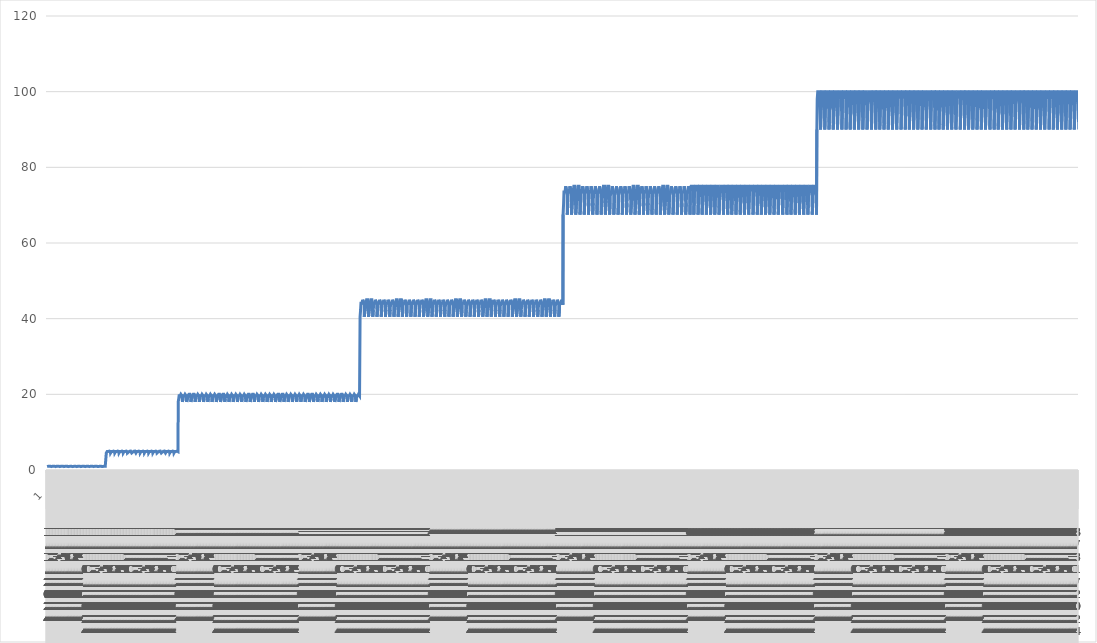
| Category | Series 0 |
|---|---|
| 0 | 0.9 |
| 1 | 0.9 |
| 2 | 0.9 |
| 3 | 0.94 |
| 4 | 0.94 |
| 5 | 0.98 |
| 6 | 0.98 |
| 7 | 0.98 |
| 8 | 0.98 |
| 9 | 0.98 |
| 10 | 0.98 |
| 11 | 0.98 |
| 12 | 0.98 |
| 13 | 0.98 |
| 14 | 0.98 |
| 15 | 1 |
| 16 | 1 |
| 17 | 1 |
| 18 | 1 |
| 19 | 1 |
| 20 | 1 |
| 21 | 0.98 |
| 22 | 0.98 |
| 23 | 0.97 |
| 24 | 0.9 |
| 25 | 0.9 |
| 26 | 0.9 |
| 27 | 0.94 |
| 28 | 0.94 |
| 29 | 0.98 |
| 30 | 0.98 |
| 31 | 0.98 |
| 32 | 0.98 |
| 33 | 0.98 |
| 34 | 0.98 |
| 35 | 0.98 |
| 36 | 0.98 |
| 37 | 0.98 |
| 38 | 0.98 |
| 39 | 1 |
| 40 | 1 |
| 41 | 1 |
| 42 | 1 |
| 43 | 1 |
| 44 | 1 |
| 45 | 0.98 |
| 46 | 0.98 |
| 47 | 0.97 |
| 48 | 0.9 |
| 49 | 0.9 |
| 50 | 0.9 |
| 51 | 0.94 |
| 52 | 0.94 |
| 53 | 0.98 |
| 54 | 0.98 |
| 55 | 0.98 |
| 56 | 0.98 |
| 57 | 0.98 |
| 58 | 0.98 |
| 59 | 0.98 |
| 60 | 0.98 |
| 61 | 0.98 |
| 62 | 0.98 |
| 63 | 1 |
| 64 | 1 |
| 65 | 1 |
| 66 | 1 |
| 67 | 1 |
| 68 | 1 |
| 69 | 0.98 |
| 70 | 0.98 |
| 71 | 0.97 |
| 72 | 0.9 |
| 73 | 0.9 |
| 74 | 0.9 |
| 75 | 0.94 |
| 76 | 0.94 |
| 77 | 0.98 |
| 78 | 0.98 |
| 79 | 0.98 |
| 80 | 0.98 |
| 81 | 0.98 |
| 82 | 0.98 |
| 83 | 0.98 |
| 84 | 0.98 |
| 85 | 0.98 |
| 86 | 0.98 |
| 87 | 1 |
| 88 | 1 |
| 89 | 1 |
| 90 | 1 |
| 91 | 1 |
| 92 | 1 |
| 93 | 0.98 |
| 94 | 0.98 |
| 95 | 0.97 |
| 96 | 0.9 |
| 97 | 0.9 |
| 98 | 0.9 |
| 99 | 0.94 |
| 100 | 0.94 |
| 101 | 0.98 |
| 102 | 0.98 |
| 103 | 0.98 |
| 104 | 0.98 |
| 105 | 0.98 |
| 106 | 0.98 |
| 107 | 0.98 |
| 108 | 0.98 |
| 109 | 0.98 |
| 110 | 0.98 |
| 111 | 1 |
| 112 | 1 |
| 113 | 1 |
| 114 | 1 |
| 115 | 1 |
| 116 | 1 |
| 117 | 0.98 |
| 118 | 0.98 |
| 119 | 0.97 |
| 120 | 0.9 |
| 121 | 0.9 |
| 122 | 0.9 |
| 123 | 0.9 |
| 124 | 0.9 |
| 125 | 0.95 |
| 126 | 0.95 |
| 127 | 0.98 |
| 128 | 0.98 |
| 129 | 0.98 |
| 130 | 0.98 |
| 131 | 0.99 |
| 132 | 0.99 |
| 133 | 1 |
| 134 | 1 |
| 135 | 1 |
| 136 | 1 |
| 137 | 1 |
| 138 | 1 |
| 139 | 1 |
| 140 | 1 |
| 141 | 1 |
| 142 | 0.98 |
| 143 | 0.98 |
| 144 | 0.9 |
| 145 | 0.9 |
| 146 | 0.9 |
| 147 | 0.9 |
| 148 | 0.9 |
| 149 | 0.95 |
| 150 | 0.95 |
| 151 | 0.98 |
| 152 | 0.98 |
| 153 | 0.98 |
| 154 | 0.98 |
| 155 | 0.99 |
| 156 | 0.99 |
| 157 | 1 |
| 158 | 1 |
| 159 | 1 |
| 160 | 1 |
| 161 | 1 |
| 162 | 1 |
| 163 | 1 |
| 164 | 1 |
| 165 | 1 |
| 166 | 0.98 |
| 167 | 0.98 |
| 168 | 0.9 |
| 169 | 0.9 |
| 170 | 0.9 |
| 171 | 0.94 |
| 172 | 0.94 |
| 173 | 0.98 |
| 174 | 0.98 |
| 175 | 0.98 |
| 176 | 0.98 |
| 177 | 0.98 |
| 178 | 0.98 |
| 179 | 0.98 |
| 180 | 0.98 |
| 181 | 0.98 |
| 182 | 0.98 |
| 183 | 1 |
| 184 | 1 |
| 185 | 1 |
| 186 | 1 |
| 187 | 1 |
| 188 | 1 |
| 189 | 0.98 |
| 190 | 0.98 |
| 191 | 0.97 |
| 192 | 0.9 |
| 193 | 0.9 |
| 194 | 0.9 |
| 195 | 0.94 |
| 196 | 0.94 |
| 197 | 0.98 |
| 198 | 0.98 |
| 199 | 0.98 |
| 200 | 0.98 |
| 201 | 0.98 |
| 202 | 0.98 |
| 203 | 0.98 |
| 204 | 0.98 |
| 205 | 0.98 |
| 206 | 0.98 |
| 207 | 1 |
| 208 | 1 |
| 209 | 1 |
| 210 | 1 |
| 211 | 1 |
| 212 | 1 |
| 213 | 0.98 |
| 214 | 0.98 |
| 215 | 0.97 |
| 216 | 0.9 |
| 217 | 0.9 |
| 218 | 0.9 |
| 219 | 0.94 |
| 220 | 0.94 |
| 221 | 0.98 |
| 222 | 0.98 |
| 223 | 0.98 |
| 224 | 0.98 |
| 225 | 0.98 |
| 226 | 0.98 |
| 227 | 0.98 |
| 228 | 0.98 |
| 229 | 0.98 |
| 230 | 0.98 |
| 231 | 1 |
| 232 | 1 |
| 233 | 1 |
| 234 | 1 |
| 235 | 1 |
| 236 | 1 |
| 237 | 0.98 |
| 238 | 0.98 |
| 239 | 0.97 |
| 240 | 0.9 |
| 241 | 0.9 |
| 242 | 0.9 |
| 243 | 0.94 |
| 244 | 0.94 |
| 245 | 0.98 |
| 246 | 0.98 |
| 247 | 0.98 |
| 248 | 0.98 |
| 249 | 0.98 |
| 250 | 0.98 |
| 251 | 0.98 |
| 252 | 0.98 |
| 253 | 0.98 |
| 254 | 0.98 |
| 255 | 1 |
| 256 | 1 |
| 257 | 1 |
| 258 | 1 |
| 259 | 1 |
| 260 | 1 |
| 261 | 0.98 |
| 262 | 0.98 |
| 263 | 0.97 |
| 264 | 0.9 |
| 265 | 0.9 |
| 266 | 0.9 |
| 267 | 0.94 |
| 268 | 0.94 |
| 269 | 0.98 |
| 270 | 0.98 |
| 271 | 0.98 |
| 272 | 0.98 |
| 273 | 0.98 |
| 274 | 0.98 |
| 275 | 0.98 |
| 276 | 0.98 |
| 277 | 0.98 |
| 278 | 0.98 |
| 279 | 1 |
| 280 | 1 |
| 281 | 1 |
| 282 | 1 |
| 283 | 1 |
| 284 | 1 |
| 285 | 0.98 |
| 286 | 0.98 |
| 287 | 0.97 |
| 288 | 0.9 |
| 289 | 0.9 |
| 290 | 0.9 |
| 291 | 0.9 |
| 292 | 0.9 |
| 293 | 0.95 |
| 294 | 0.95 |
| 295 | 0.98 |
| 296 | 0.98 |
| 297 | 0.98 |
| 298 | 0.98 |
| 299 | 0.99 |
| 300 | 0.99 |
| 301 | 1 |
| 302 | 1 |
| 303 | 1 |
| 304 | 1 |
| 305 | 1 |
| 306 | 1 |
| 307 | 1 |
| 308 | 1 |
| 309 | 1 |
| 310 | 0.98 |
| 311 | 0.98 |
| 312 | 0.9 |
| 313 | 0.9 |
| 314 | 0.9 |
| 315 | 0.9 |
| 316 | 0.9 |
| 317 | 0.95 |
| 318 | 0.95 |
| 319 | 0.98 |
| 320 | 0.98 |
| 321 | 0.98 |
| 322 | 0.98 |
| 323 | 0.99 |
| 324 | 0.99 |
| 325 | 1 |
| 326 | 1 |
| 327 | 1 |
| 328 | 1 |
| 329 | 1 |
| 330 | 1 |
| 331 | 1 |
| 332 | 1 |
| 333 | 1 |
| 334 | 0.98 |
| 335 | 0.98 |
| 336 | 4.5 |
| 337 | 4.5 |
| 338 | 4.5 |
| 339 | 4.7 |
| 340 | 4.7 |
| 341 | 4.9 |
| 342 | 4.9 |
| 343 | 4.9 |
| 344 | 4.9 |
| 345 | 4.9 |
| 346 | 4.9 |
| 347 | 4.9 |
| 348 | 4.9 |
| 349 | 4.9 |
| 350 | 4.9 |
| 351 | 5 |
| 352 | 5 |
| 353 | 5 |
| 354 | 5 |
| 355 | 5 |
| 356 | 5 |
| 357 | 4.9 |
| 358 | 4.9 |
| 359 | 4.85 |
| 360 | 4.5 |
| 361 | 4.5 |
| 362 | 4.5 |
| 363 | 4.7 |
| 364 | 4.7 |
| 365 | 4.9 |
| 366 | 4.9 |
| 367 | 4.9 |
| 368 | 4.9 |
| 369 | 4.9 |
| 370 | 4.9 |
| 371 | 4.9 |
| 372 | 4.9 |
| 373 | 4.9 |
| 374 | 4.9 |
| 375 | 5 |
| 376 | 5 |
| 377 | 5 |
| 378 | 5 |
| 379 | 5 |
| 380 | 5 |
| 381 | 4.9 |
| 382 | 4.9 |
| 383 | 4.85 |
| 384 | 4.5 |
| 385 | 4.5 |
| 386 | 4.5 |
| 387 | 4.7 |
| 388 | 4.7 |
| 389 | 4.9 |
| 390 | 4.9 |
| 391 | 4.9 |
| 392 | 4.9 |
| 393 | 4.9 |
| 394 | 4.9 |
| 395 | 4.9 |
| 396 | 4.9 |
| 397 | 4.9 |
| 398 | 4.9 |
| 399 | 5 |
| 400 | 5 |
| 401 | 5 |
| 402 | 5 |
| 403 | 5 |
| 404 | 5 |
| 405 | 4.9 |
| 406 | 4.9 |
| 407 | 4.85 |
| 408 | 4.5 |
| 409 | 4.5 |
| 410 | 4.5 |
| 411 | 4.7 |
| 412 | 4.7 |
| 413 | 4.9 |
| 414 | 4.9 |
| 415 | 4.9 |
| 416 | 4.9 |
| 417 | 4.9 |
| 418 | 4.9 |
| 419 | 4.9 |
| 420 | 4.9 |
| 421 | 4.9 |
| 422 | 4.9 |
| 423 | 5 |
| 424 | 5 |
| 425 | 5 |
| 426 | 5 |
| 427 | 5 |
| 428 | 5 |
| 429 | 4.9 |
| 430 | 4.9 |
| 431 | 4.85 |
| 432 | 4.5 |
| 433 | 4.5 |
| 434 | 4.5 |
| 435 | 4.7 |
| 436 | 4.7 |
| 437 | 4.9 |
| 438 | 4.9 |
| 439 | 4.9 |
| 440 | 4.9 |
| 441 | 4.9 |
| 442 | 4.9 |
| 443 | 4.9 |
| 444 | 4.9 |
| 445 | 4.9 |
| 446 | 4.9 |
| 447 | 5 |
| 448 | 5 |
| 449 | 5 |
| 450 | 5 |
| 451 | 5 |
| 452 | 5 |
| 453 | 4.9 |
| 454 | 4.9 |
| 455 | 4.85 |
| 456 | 4.5 |
| 457 | 4.5 |
| 458 | 4.5 |
| 459 | 4.5 |
| 460 | 4.5 |
| 461 | 4.75 |
| 462 | 4.75 |
| 463 | 4.9 |
| 464 | 4.9 |
| 465 | 4.9 |
| 466 | 4.9 |
| 467 | 4.95 |
| 468 | 4.95 |
| 469 | 5 |
| 470 | 5 |
| 471 | 5 |
| 472 | 5 |
| 473 | 5 |
| 474 | 5 |
| 475 | 5 |
| 476 | 5 |
| 477 | 5 |
| 478 | 4.9 |
| 479 | 4.9 |
| 480 | 4.5 |
| 481 | 4.5 |
| 482 | 4.5 |
| 483 | 4.5 |
| 484 | 4.5 |
| 485 | 4.75 |
| 486 | 4.75 |
| 487 | 4.9 |
| 488 | 4.9 |
| 489 | 4.9 |
| 490 | 4.9 |
| 491 | 4.95 |
| 492 | 4.95 |
| 493 | 5 |
| 494 | 5 |
| 495 | 5 |
| 496 | 5 |
| 497 | 5 |
| 498 | 5 |
| 499 | 5 |
| 500 | 5 |
| 501 | 5 |
| 502 | 4.9 |
| 503 | 4.9 |
| 504 | 4.5 |
| 505 | 4.5 |
| 506 | 4.5 |
| 507 | 4.7 |
| 508 | 4.7 |
| 509 | 4.9 |
| 510 | 4.9 |
| 511 | 4.9 |
| 512 | 4.9 |
| 513 | 4.9 |
| 514 | 4.9 |
| 515 | 4.9 |
| 516 | 4.9 |
| 517 | 4.9 |
| 518 | 4.9 |
| 519 | 5 |
| 520 | 5 |
| 521 | 5 |
| 522 | 5 |
| 523 | 5 |
| 524 | 5 |
| 525 | 4.9 |
| 526 | 4.9 |
| 527 | 4.85 |
| 528 | 4.5 |
| 529 | 4.5 |
| 530 | 4.5 |
| 531 | 4.7 |
| 532 | 4.7 |
| 533 | 4.9 |
| 534 | 4.9 |
| 535 | 4.9 |
| 536 | 4.9 |
| 537 | 4.9 |
| 538 | 4.9 |
| 539 | 4.9 |
| 540 | 4.9 |
| 541 | 4.9 |
| 542 | 4.9 |
| 543 | 5 |
| 544 | 5 |
| 545 | 5 |
| 546 | 5 |
| 547 | 5 |
| 548 | 5 |
| 549 | 4.9 |
| 550 | 4.9 |
| 551 | 4.85 |
| 552 | 4.5 |
| 553 | 4.5 |
| 554 | 4.5 |
| 555 | 4.7 |
| 556 | 4.7 |
| 557 | 4.9 |
| 558 | 4.9 |
| 559 | 4.9 |
| 560 | 4.9 |
| 561 | 4.9 |
| 562 | 4.9 |
| 563 | 4.9 |
| 564 | 4.9 |
| 565 | 4.9 |
| 566 | 4.9 |
| 567 | 5 |
| 568 | 5 |
| 569 | 5 |
| 570 | 5 |
| 571 | 5 |
| 572 | 5 |
| 573 | 4.9 |
| 574 | 4.9 |
| 575 | 4.85 |
| 576 | 4.5 |
| 577 | 4.5 |
| 578 | 4.5 |
| 579 | 4.7 |
| 580 | 4.7 |
| 581 | 4.9 |
| 582 | 4.9 |
| 583 | 4.9 |
| 584 | 4.9 |
| 585 | 4.9 |
| 586 | 4.9 |
| 587 | 4.9 |
| 588 | 4.9 |
| 589 | 4.9 |
| 590 | 4.9 |
| 591 | 5 |
| 592 | 5 |
| 593 | 5 |
| 594 | 5 |
| 595 | 5 |
| 596 | 5 |
| 597 | 4.9 |
| 598 | 4.9 |
| 599 | 4.85 |
| 600 | 4.5 |
| 601 | 4.5 |
| 602 | 4.5 |
| 603 | 4.7 |
| 604 | 4.7 |
| 605 | 4.9 |
| 606 | 4.9 |
| 607 | 4.9 |
| 608 | 4.9 |
| 609 | 4.9 |
| 610 | 4.9 |
| 611 | 4.9 |
| 612 | 4.9 |
| 613 | 4.9 |
| 614 | 4.9 |
| 615 | 5 |
| 616 | 5 |
| 617 | 5 |
| 618 | 5 |
| 619 | 5 |
| 620 | 5 |
| 621 | 4.9 |
| 622 | 4.9 |
| 623 | 4.85 |
| 624 | 4.5 |
| 625 | 4.5 |
| 626 | 4.5 |
| 627 | 4.5 |
| 628 | 4.5 |
| 629 | 4.75 |
| 630 | 4.75 |
| 631 | 4.9 |
| 632 | 4.9 |
| 633 | 4.9 |
| 634 | 4.9 |
| 635 | 4.95 |
| 636 | 4.95 |
| 637 | 5 |
| 638 | 5 |
| 639 | 5 |
| 640 | 5 |
| 641 | 5 |
| 642 | 5 |
| 643 | 5 |
| 644 | 5 |
| 645 | 5 |
| 646 | 4.9 |
| 647 | 4.9 |
| 648 | 4.5 |
| 649 | 4.5 |
| 650 | 4.5 |
| 651 | 4.5 |
| 652 | 4.5 |
| 653 | 4.75 |
| 654 | 4.75 |
| 655 | 4.9 |
| 656 | 4.9 |
| 657 | 4.9 |
| 658 | 4.9 |
| 659 | 4.95 |
| 660 | 4.95 |
| 661 | 5 |
| 662 | 5 |
| 663 | 5 |
| 664 | 5 |
| 665 | 5 |
| 666 | 5 |
| 667 | 5 |
| 668 | 5 |
| 669 | 5 |
| 670 | 4.9 |
| 671 | 4.9 |
| 672 | 4.5 |
| 673 | 4.5 |
| 674 | 4.5 |
| 675 | 4.7 |
| 676 | 4.7 |
| 677 | 4.9 |
| 678 | 4.9 |
| 679 | 4.9 |
| 680 | 4.9 |
| 681 | 4.9 |
| 682 | 4.9 |
| 683 | 4.9 |
| 684 | 4.9 |
| 685 | 4.9 |
| 686 | 4.9 |
| 687 | 5 |
| 688 | 5 |
| 689 | 5 |
| 690 | 5 |
| 691 | 5 |
| 692 | 5 |
| 693 | 4.9 |
| 694 | 4.9 |
| 695 | 4.85 |
| 696 | 4.5 |
| 697 | 4.5 |
| 698 | 4.5 |
| 699 | 4.7 |
| 700 | 4.7 |
| 701 | 4.9 |
| 702 | 4.9 |
| 703 | 4.9 |
| 704 | 4.9 |
| 705 | 4.9 |
| 706 | 4.9 |
| 707 | 4.9 |
| 708 | 4.9 |
| 709 | 4.9 |
| 710 | 4.9 |
| 711 | 5 |
| 712 | 5 |
| 713 | 5 |
| 714 | 5 |
| 715 | 5 |
| 716 | 5 |
| 717 | 4.9 |
| 718 | 4.9 |
| 719 | 4.85 |
| 720 | 4.5 |
| 721 | 4.5 |
| 722 | 4.5 |
| 723 | 4.7 |
| 724 | 4.7 |
| 725 | 4.9 |
| 726 | 4.9 |
| 727 | 4.9 |
| 728 | 4.9 |
| 729 | 4.9 |
| 730 | 4.9 |
| 731 | 4.9 |
| 732 | 4.9 |
| 733 | 4.9 |
| 734 | 4.9 |
| 735 | 5 |
| 736 | 5 |
| 737 | 5 |
| 738 | 5 |
| 739 | 5 |
| 740 | 5 |
| 741 | 4.9 |
| 742 | 4.9 |
| 743 | 4.85 |
| 744 | 18 |
| 745 | 18 |
| 746 | 18 |
| 747 | 18.8 |
| 748 | 18.8 |
| 749 | 19.6 |
| 750 | 19.6 |
| 751 | 19.6 |
| 752 | 19.6 |
| 753 | 19.6 |
| 754 | 19.6 |
| 755 | 19.6 |
| 756 | 19.6 |
| 757 | 19.6 |
| 758 | 19.6 |
| 759 | 20 |
| 760 | 20 |
| 761 | 20 |
| 762 | 20 |
| 763 | 20 |
| 764 | 20 |
| 765 | 19.6 |
| 766 | 19.6 |
| 767 | 19.4 |
| 768 | 18 |
| 769 | 18 |
| 770 | 18 |
| 771 | 18.8 |
| 772 | 18.8 |
| 773 | 19.6 |
| 774 | 19.6 |
| 775 | 19.6 |
| 776 | 19.6 |
| 777 | 19.6 |
| 778 | 19.6 |
| 779 | 19.6 |
| 780 | 19.6 |
| 781 | 19.6 |
| 782 | 19.6 |
| 783 | 20 |
| 784 | 20 |
| 785 | 20 |
| 786 | 20 |
| 787 | 20 |
| 788 | 20 |
| 789 | 19.6 |
| 790 | 19.6 |
| 791 | 19.4 |
| 792 | 18 |
| 793 | 18 |
| 794 | 18 |
| 795 | 18 |
| 796 | 18 |
| 797 | 19 |
| 798 | 19 |
| 799 | 19.6 |
| 800 | 19.6 |
| 801 | 19.6 |
| 802 | 19.6 |
| 803 | 19.8 |
| 804 | 19.8 |
| 805 | 20 |
| 806 | 20 |
| 807 | 20 |
| 808 | 20 |
| 809 | 20 |
| 810 | 20 |
| 811 | 20 |
| 812 | 20 |
| 813 | 20 |
| 814 | 19.6 |
| 815 | 19.6 |
| 816 | 18 |
| 817 | 18 |
| 818 | 18 |
| 819 | 18 |
| 820 | 18 |
| 821 | 19 |
| 822 | 19 |
| 823 | 19.6 |
| 824 | 19.6 |
| 825 | 19.6 |
| 826 | 19.6 |
| 827 | 19.8 |
| 828 | 19.8 |
| 829 | 20 |
| 830 | 20 |
| 831 | 20 |
| 832 | 20 |
| 833 | 20 |
| 834 | 20 |
| 835 | 20 |
| 836 | 20 |
| 837 | 20 |
| 838 | 19.6 |
| 839 | 19.6 |
| 840 | 18 |
| 841 | 18 |
| 842 | 18 |
| 843 | 18.8 |
| 844 | 18.8 |
| 845 | 19.6 |
| 846 | 19.6 |
| 847 | 19.6 |
| 848 | 19.6 |
| 849 | 19.6 |
| 850 | 19.6 |
| 851 | 19.6 |
| 852 | 19.6 |
| 853 | 19.6 |
| 854 | 19.6 |
| 855 | 20 |
| 856 | 20 |
| 857 | 20 |
| 858 | 20 |
| 859 | 20 |
| 860 | 20 |
| 861 | 19.6 |
| 862 | 19.6 |
| 863 | 19.4 |
| 864 | 18 |
| 865 | 18 |
| 866 | 18 |
| 867 | 18.8 |
| 868 | 18.8 |
| 869 | 19.6 |
| 870 | 19.6 |
| 871 | 19.6 |
| 872 | 19.6 |
| 873 | 19.6 |
| 874 | 19.6 |
| 875 | 19.6 |
| 876 | 19.6 |
| 877 | 19.6 |
| 878 | 19.6 |
| 879 | 20 |
| 880 | 20 |
| 881 | 20 |
| 882 | 20 |
| 883 | 20 |
| 884 | 20 |
| 885 | 19.6 |
| 886 | 19.6 |
| 887 | 19.4 |
| 888 | 18 |
| 889 | 18 |
| 890 | 18 |
| 891 | 18.8 |
| 892 | 18.8 |
| 893 | 19.6 |
| 894 | 19.6 |
| 895 | 19.6 |
| 896 | 19.6 |
| 897 | 19.6 |
| 898 | 19.6 |
| 899 | 19.6 |
| 900 | 19.6 |
| 901 | 19.6 |
| 902 | 19.6 |
| 903 | 20 |
| 904 | 20 |
| 905 | 20 |
| 906 | 20 |
| 907 | 20 |
| 908 | 20 |
| 909 | 19.6 |
| 910 | 19.6 |
| 911 | 19.4 |
| 912 | 18 |
| 913 | 18 |
| 914 | 18 |
| 915 | 18.8 |
| 916 | 18.8 |
| 917 | 19.6 |
| 918 | 19.6 |
| 919 | 19.6 |
| 920 | 19.6 |
| 921 | 19.6 |
| 922 | 19.6 |
| 923 | 19.6 |
| 924 | 19.6 |
| 925 | 19.6 |
| 926 | 19.6 |
| 927 | 20 |
| 928 | 20 |
| 929 | 20 |
| 930 | 20 |
| 931 | 20 |
| 932 | 20 |
| 933 | 19.6 |
| 934 | 19.6 |
| 935 | 19.4 |
| 936 | 18 |
| 937 | 18 |
| 938 | 18 |
| 939 | 18.8 |
| 940 | 18.8 |
| 941 | 19.6 |
| 942 | 19.6 |
| 943 | 19.6 |
| 944 | 19.6 |
| 945 | 19.6 |
| 946 | 19.6 |
| 947 | 19.6 |
| 948 | 19.6 |
| 949 | 19.6 |
| 950 | 19.6 |
| 951 | 20 |
| 952 | 20 |
| 953 | 20 |
| 954 | 20 |
| 955 | 20 |
| 956 | 20 |
| 957 | 19.6 |
| 958 | 19.6 |
| 959 | 19.4 |
| 960 | 18 |
| 961 | 18 |
| 962 | 18 |
| 963 | 18 |
| 964 | 18 |
| 965 | 19 |
| 966 | 19 |
| 967 | 19.6 |
| 968 | 19.6 |
| 969 | 19.6 |
| 970 | 19.6 |
| 971 | 19.8 |
| 972 | 19.8 |
| 973 | 20 |
| 974 | 20 |
| 975 | 20 |
| 976 | 20 |
| 977 | 20 |
| 978 | 20 |
| 979 | 20 |
| 980 | 20 |
| 981 | 20 |
| 982 | 19.6 |
| 983 | 19.6 |
| 984 | 18 |
| 985 | 18 |
| 986 | 18 |
| 987 | 18 |
| 988 | 18 |
| 989 | 19 |
| 990 | 19 |
| 991 | 19.6 |
| 992 | 19.6 |
| 993 | 19.6 |
| 994 | 19.6 |
| 995 | 19.8 |
| 996 | 19.8 |
| 997 | 20 |
| 998 | 20 |
| 999 | 20 |
| 1000 | 20 |
| 1001 | 20 |
| 1002 | 20 |
| 1003 | 20 |
| 1004 | 20 |
| 1005 | 20 |
| 1006 | 19.6 |
| 1007 | 19.6 |
| 1008 | 18 |
| 1009 | 18 |
| 1010 | 18 |
| 1011 | 18.8 |
| 1012 | 18.8 |
| 1013 | 19.6 |
| 1014 | 19.6 |
| 1015 | 19.6 |
| 1016 | 19.6 |
| 1017 | 19.6 |
| 1018 | 19.6 |
| 1019 | 19.6 |
| 1020 | 19.6 |
| 1021 | 19.6 |
| 1022 | 19.6 |
| 1023 | 20 |
| 1024 | 20 |
| 1025 | 20 |
| 1026 | 20 |
| 1027 | 20 |
| 1028 | 20 |
| 1029 | 19.6 |
| 1030 | 19.6 |
| 1031 | 19.4 |
| 1032 | 18 |
| 1033 | 18 |
| 1034 | 18 |
| 1035 | 18.8 |
| 1036 | 18.8 |
| 1037 | 19.6 |
| 1038 | 19.6 |
| 1039 | 19.6 |
| 1040 | 19.6 |
| 1041 | 19.6 |
| 1042 | 19.6 |
| 1043 | 19.6 |
| 1044 | 19.6 |
| 1045 | 19.6 |
| 1046 | 19.6 |
| 1047 | 20 |
| 1048 | 20 |
| 1049 | 20 |
| 1050 | 20 |
| 1051 | 20 |
| 1052 | 20 |
| 1053 | 19.6 |
| 1054 | 19.6 |
| 1055 | 19.4 |
| 1056 | 18 |
| 1057 | 18 |
| 1058 | 18 |
| 1059 | 18.8 |
| 1060 | 18.8 |
| 1061 | 19.6 |
| 1062 | 19.6 |
| 1063 | 19.6 |
| 1064 | 19.6 |
| 1065 | 19.6 |
| 1066 | 19.6 |
| 1067 | 19.6 |
| 1068 | 19.6 |
| 1069 | 19.6 |
| 1070 | 19.6 |
| 1071 | 20 |
| 1072 | 20 |
| 1073 | 20 |
| 1074 | 20 |
| 1075 | 20 |
| 1076 | 20 |
| 1077 | 19.6 |
| 1078 | 19.6 |
| 1079 | 19.4 |
| 1080 | 18 |
| 1081 | 18 |
| 1082 | 18 |
| 1083 | 18.8 |
| 1084 | 18.8 |
| 1085 | 19.6 |
| 1086 | 19.6 |
| 1087 | 19.6 |
| 1088 | 19.6 |
| 1089 | 19.6 |
| 1090 | 19.6 |
| 1091 | 19.6 |
| 1092 | 19.6 |
| 1093 | 19.6 |
| 1094 | 19.6 |
| 1095 | 20 |
| 1096 | 20 |
| 1097 | 20 |
| 1098 | 20 |
| 1099 | 20 |
| 1100 | 20 |
| 1101 | 19.6 |
| 1102 | 19.6 |
| 1103 | 19.4 |
| 1104 | 18 |
| 1105 | 18 |
| 1106 | 18 |
| 1107 | 18.8 |
| 1108 | 18.8 |
| 1109 | 19.6 |
| 1110 | 19.6 |
| 1111 | 19.6 |
| 1112 | 19.6 |
| 1113 | 19.6 |
| 1114 | 19.6 |
| 1115 | 19.6 |
| 1116 | 19.6 |
| 1117 | 19.6 |
| 1118 | 19.6 |
| 1119 | 20 |
| 1120 | 20 |
| 1121 | 20 |
| 1122 | 20 |
| 1123 | 20 |
| 1124 | 20 |
| 1125 | 19.6 |
| 1126 | 19.6 |
| 1127 | 19.4 |
| 1128 | 18 |
| 1129 | 18 |
| 1130 | 18 |
| 1131 | 18 |
| 1132 | 18 |
| 1133 | 19 |
| 1134 | 19 |
| 1135 | 19.6 |
| 1136 | 19.6 |
| 1137 | 19.6 |
| 1138 | 19.6 |
| 1139 | 19.8 |
| 1140 | 19.8 |
| 1141 | 20 |
| 1142 | 20 |
| 1143 | 20 |
| 1144 | 20 |
| 1145 | 20 |
| 1146 | 20 |
| 1147 | 20 |
| 1148 | 20 |
| 1149 | 20 |
| 1150 | 19.6 |
| 1151 | 19.6 |
| 1152 | 18 |
| 1153 | 18 |
| 1154 | 18 |
| 1155 | 18 |
| 1156 | 18 |
| 1157 | 19 |
| 1158 | 19 |
| 1159 | 19.6 |
| 1160 | 19.6 |
| 1161 | 19.6 |
| 1162 | 19.6 |
| 1163 | 19.8 |
| 1164 | 19.8 |
| 1165 | 20 |
| 1166 | 20 |
| 1167 | 20 |
| 1168 | 20 |
| 1169 | 20 |
| 1170 | 20 |
| 1171 | 20 |
| 1172 | 20 |
| 1173 | 20 |
| 1174 | 19.6 |
| 1175 | 19.6 |
| 1176 | 18 |
| 1177 | 18 |
| 1178 | 18 |
| 1179 | 18.8 |
| 1180 | 18.8 |
| 1181 | 19.6 |
| 1182 | 19.6 |
| 1183 | 19.6 |
| 1184 | 19.6 |
| 1185 | 19.6 |
| 1186 | 19.6 |
| 1187 | 19.6 |
| 1188 | 19.6 |
| 1189 | 19.6 |
| 1190 | 19.6 |
| 1191 | 20 |
| 1192 | 20 |
| 1193 | 20 |
| 1194 | 20 |
| 1195 | 20 |
| 1196 | 20 |
| 1197 | 19.6 |
| 1198 | 19.6 |
| 1199 | 19.4 |
| 1200 | 18 |
| 1201 | 18 |
| 1202 | 18 |
| 1203 | 18.8 |
| 1204 | 18.8 |
| 1205 | 19.6 |
| 1206 | 19.6 |
| 1207 | 19.6 |
| 1208 | 19.6 |
| 1209 | 19.6 |
| 1210 | 19.6 |
| 1211 | 19.6 |
| 1212 | 19.6 |
| 1213 | 19.6 |
| 1214 | 19.6 |
| 1215 | 20 |
| 1216 | 20 |
| 1217 | 20 |
| 1218 | 20 |
| 1219 | 20 |
| 1220 | 20 |
| 1221 | 19.6 |
| 1222 | 19.6 |
| 1223 | 19.4 |
| 1224 | 18 |
| 1225 | 18 |
| 1226 | 18 |
| 1227 | 18.8 |
| 1228 | 18.8 |
| 1229 | 19.6 |
| 1230 | 19.6 |
| 1231 | 19.6 |
| 1232 | 19.6 |
| 1233 | 19.6 |
| 1234 | 19.6 |
| 1235 | 19.6 |
| 1236 | 19.6 |
| 1237 | 19.6 |
| 1238 | 19.6 |
| 1239 | 20 |
| 1240 | 20 |
| 1241 | 20 |
| 1242 | 20 |
| 1243 | 20 |
| 1244 | 20 |
| 1245 | 19.6 |
| 1246 | 19.6 |
| 1247 | 19.4 |
| 1248 | 18 |
| 1249 | 18 |
| 1250 | 18 |
| 1251 | 18.8 |
| 1252 | 18.8 |
| 1253 | 19.6 |
| 1254 | 19.6 |
| 1255 | 19.6 |
| 1256 | 19.6 |
| 1257 | 19.6 |
| 1258 | 19.6 |
| 1259 | 19.6 |
| 1260 | 19.6 |
| 1261 | 19.6 |
| 1262 | 19.6 |
| 1263 | 20 |
| 1264 | 20 |
| 1265 | 20 |
| 1266 | 20 |
| 1267 | 20 |
| 1268 | 20 |
| 1269 | 19.6 |
| 1270 | 19.6 |
| 1271 | 19.4 |
| 1272 | 18 |
| 1273 | 18 |
| 1274 | 18 |
| 1275 | 18.8 |
| 1276 | 18.8 |
| 1277 | 19.6 |
| 1278 | 19.6 |
| 1279 | 19.6 |
| 1280 | 19.6 |
| 1281 | 19.6 |
| 1282 | 19.6 |
| 1283 | 19.6 |
| 1284 | 19.6 |
| 1285 | 19.6 |
| 1286 | 19.6 |
| 1287 | 20 |
| 1288 | 20 |
| 1289 | 20 |
| 1290 | 20 |
| 1291 | 20 |
| 1292 | 20 |
| 1293 | 19.6 |
| 1294 | 19.6 |
| 1295 | 19.4 |
| 1296 | 18 |
| 1297 | 18 |
| 1298 | 18 |
| 1299 | 18 |
| 1300 | 18 |
| 1301 | 19 |
| 1302 | 19 |
| 1303 | 19.6 |
| 1304 | 19.6 |
| 1305 | 19.6 |
| 1306 | 19.6 |
| 1307 | 19.8 |
| 1308 | 19.8 |
| 1309 | 20 |
| 1310 | 20 |
| 1311 | 20 |
| 1312 | 20 |
| 1313 | 20 |
| 1314 | 20 |
| 1315 | 20 |
| 1316 | 20 |
| 1317 | 20 |
| 1318 | 19.6 |
| 1319 | 19.6 |
| 1320 | 18 |
| 1321 | 18 |
| 1322 | 18 |
| 1323 | 18 |
| 1324 | 18 |
| 1325 | 19 |
| 1326 | 19 |
| 1327 | 19.6 |
| 1328 | 19.6 |
| 1329 | 19.6 |
| 1330 | 19.6 |
| 1331 | 19.8 |
| 1332 | 19.8 |
| 1333 | 20 |
| 1334 | 20 |
| 1335 | 20 |
| 1336 | 20 |
| 1337 | 20 |
| 1338 | 20 |
| 1339 | 20 |
| 1340 | 20 |
| 1341 | 20 |
| 1342 | 19.6 |
| 1343 | 19.6 |
| 1344 | 18 |
| 1345 | 18 |
| 1346 | 18 |
| 1347 | 18.8 |
| 1348 | 18.8 |
| 1349 | 19.6 |
| 1350 | 19.6 |
| 1351 | 19.6 |
| 1352 | 19.6 |
| 1353 | 19.6 |
| 1354 | 19.6 |
| 1355 | 19.6 |
| 1356 | 19.6 |
| 1357 | 19.6 |
| 1358 | 19.6 |
| 1359 | 20 |
| 1360 | 20 |
| 1361 | 20 |
| 1362 | 20 |
| 1363 | 20 |
| 1364 | 20 |
| 1365 | 19.6 |
| 1366 | 19.6 |
| 1367 | 19.4 |
| 1368 | 18 |
| 1369 | 18 |
| 1370 | 18 |
| 1371 | 18.8 |
| 1372 | 18.8 |
| 1373 | 19.6 |
| 1374 | 19.6 |
| 1375 | 19.6 |
| 1376 | 19.6 |
| 1377 | 19.6 |
| 1378 | 19.6 |
| 1379 | 19.6 |
| 1380 | 19.6 |
| 1381 | 19.6 |
| 1382 | 19.6 |
| 1383 | 20 |
| 1384 | 20 |
| 1385 | 20 |
| 1386 | 20 |
| 1387 | 20 |
| 1388 | 20 |
| 1389 | 19.6 |
| 1390 | 19.6 |
| 1391 | 19.4 |
| 1392 | 18 |
| 1393 | 18 |
| 1394 | 18 |
| 1395 | 18.8 |
| 1396 | 18.8 |
| 1397 | 19.6 |
| 1398 | 19.6 |
| 1399 | 19.6 |
| 1400 | 19.6 |
| 1401 | 19.6 |
| 1402 | 19.6 |
| 1403 | 19.6 |
| 1404 | 19.6 |
| 1405 | 19.6 |
| 1406 | 19.6 |
| 1407 | 20 |
| 1408 | 20 |
| 1409 | 20 |
| 1410 | 20 |
| 1411 | 20 |
| 1412 | 20 |
| 1413 | 19.6 |
| 1414 | 19.6 |
| 1415 | 19.4 |
| 1416 | 18 |
| 1417 | 18 |
| 1418 | 18 |
| 1419 | 18.8 |
| 1420 | 18.8 |
| 1421 | 19.6 |
| 1422 | 19.6 |
| 1423 | 19.6 |
| 1424 | 19.6 |
| 1425 | 19.6 |
| 1426 | 19.6 |
| 1427 | 19.6 |
| 1428 | 19.6 |
| 1429 | 19.6 |
| 1430 | 19.6 |
| 1431 | 20 |
| 1432 | 20 |
| 1433 | 20 |
| 1434 | 20 |
| 1435 | 20 |
| 1436 | 20 |
| 1437 | 19.6 |
| 1438 | 19.6 |
| 1439 | 19.4 |
| 1440 | 18 |
| 1441 | 18 |
| 1442 | 18 |
| 1443 | 18.8 |
| 1444 | 18.8 |
| 1445 | 19.6 |
| 1446 | 19.6 |
| 1447 | 19.6 |
| 1448 | 19.6 |
| 1449 | 19.6 |
| 1450 | 19.6 |
| 1451 | 19.6 |
| 1452 | 19.6 |
| 1453 | 19.6 |
| 1454 | 19.6 |
| 1455 | 20 |
| 1456 | 20 |
| 1457 | 20 |
| 1458 | 20 |
| 1459 | 20 |
| 1460 | 20 |
| 1461 | 19.6 |
| 1462 | 19.6 |
| 1463 | 19.4 |
| 1464 | 18 |
| 1465 | 18 |
| 1466 | 18 |
| 1467 | 18 |
| 1468 | 18 |
| 1469 | 19 |
| 1470 | 19 |
| 1471 | 19.6 |
| 1472 | 19.6 |
| 1473 | 19.6 |
| 1474 | 19.6 |
| 1475 | 19.8 |
| 1476 | 19.8 |
| 1477 | 20 |
| 1478 | 20 |
| 1479 | 20 |
| 1480 | 20 |
| 1481 | 20 |
| 1482 | 20 |
| 1483 | 20 |
| 1484 | 20 |
| 1485 | 20 |
| 1486 | 19.6 |
| 1487 | 19.6 |
| 1488 | 18 |
| 1489 | 18 |
| 1490 | 18 |
| 1491 | 18 |
| 1492 | 18 |
| 1493 | 19 |
| 1494 | 19 |
| 1495 | 19.6 |
| 1496 | 19.6 |
| 1497 | 19.6 |
| 1498 | 19.6 |
| 1499 | 19.8 |
| 1500 | 19.8 |
| 1501 | 20 |
| 1502 | 20 |
| 1503 | 20 |
| 1504 | 20 |
| 1505 | 20 |
| 1506 | 20 |
| 1507 | 20 |
| 1508 | 20 |
| 1509 | 20 |
| 1510 | 19.6 |
| 1511 | 19.6 |
| 1512 | 18 |
| 1513 | 18 |
| 1514 | 18 |
| 1515 | 18.8 |
| 1516 | 18.8 |
| 1517 | 19.6 |
| 1518 | 19.6 |
| 1519 | 19.6 |
| 1520 | 19.6 |
| 1521 | 19.6 |
| 1522 | 19.6 |
| 1523 | 19.6 |
| 1524 | 19.6 |
| 1525 | 19.6 |
| 1526 | 19.6 |
| 1527 | 20 |
| 1528 | 20 |
| 1529 | 20 |
| 1530 | 20 |
| 1531 | 20 |
| 1532 | 20 |
| 1533 | 19.6 |
| 1534 | 19.6 |
| 1535 | 19.4 |
| 1536 | 18 |
| 1537 | 18 |
| 1538 | 18 |
| 1539 | 18.8 |
| 1540 | 18.8 |
| 1541 | 19.6 |
| 1542 | 19.6 |
| 1543 | 19.6 |
| 1544 | 19.6 |
| 1545 | 19.6 |
| 1546 | 19.6 |
| 1547 | 19.6 |
| 1548 | 19.6 |
| 1549 | 19.6 |
| 1550 | 19.6 |
| 1551 | 20 |
| 1552 | 20 |
| 1553 | 20 |
| 1554 | 20 |
| 1555 | 20 |
| 1556 | 20 |
| 1557 | 19.6 |
| 1558 | 19.6 |
| 1559 | 19.4 |
| 1560 | 18 |
| 1561 | 18 |
| 1562 | 18 |
| 1563 | 18.8 |
| 1564 | 18.8 |
| 1565 | 19.6 |
| 1566 | 19.6 |
| 1567 | 19.6 |
| 1568 | 19.6 |
| 1569 | 19.6 |
| 1570 | 19.6 |
| 1571 | 19.6 |
| 1572 | 19.6 |
| 1573 | 19.6 |
| 1574 | 19.6 |
| 1575 | 20 |
| 1576 | 20 |
| 1577 | 20 |
| 1578 | 20 |
| 1579 | 20 |
| 1580 | 20 |
| 1581 | 19.6 |
| 1582 | 19.6 |
| 1583 | 19.4 |
| 1584 | 18 |
| 1585 | 18 |
| 1586 | 18 |
| 1587 | 18.8 |
| 1588 | 18.8 |
| 1589 | 19.6 |
| 1590 | 19.6 |
| 1591 | 19.6 |
| 1592 | 19.6 |
| 1593 | 19.6 |
| 1594 | 19.6 |
| 1595 | 19.6 |
| 1596 | 19.6 |
| 1597 | 19.6 |
| 1598 | 19.6 |
| 1599 | 20 |
| 1600 | 20 |
| 1601 | 20 |
| 1602 | 20 |
| 1603 | 20 |
| 1604 | 20 |
| 1605 | 19.6 |
| 1606 | 19.6 |
| 1607 | 19.4 |
| 1608 | 18 |
| 1609 | 18 |
| 1610 | 18 |
| 1611 | 18.8 |
| 1612 | 18.8 |
| 1613 | 19.6 |
| 1614 | 19.6 |
| 1615 | 19.6 |
| 1616 | 19.6 |
| 1617 | 19.6 |
| 1618 | 19.6 |
| 1619 | 19.6 |
| 1620 | 19.6 |
| 1621 | 19.6 |
| 1622 | 19.6 |
| 1623 | 20 |
| 1624 | 20 |
| 1625 | 20 |
| 1626 | 20 |
| 1627 | 20 |
| 1628 | 20 |
| 1629 | 19.6 |
| 1630 | 19.6 |
| 1631 | 19.4 |
| 1632 | 18 |
| 1633 | 18 |
| 1634 | 18 |
| 1635 | 18 |
| 1636 | 18 |
| 1637 | 19 |
| 1638 | 19 |
| 1639 | 19.6 |
| 1640 | 19.6 |
| 1641 | 19.6 |
| 1642 | 19.6 |
| 1643 | 19.8 |
| 1644 | 19.8 |
| 1645 | 20 |
| 1646 | 20 |
| 1647 | 20 |
| 1648 | 20 |
| 1649 | 20 |
| 1650 | 20 |
| 1651 | 20 |
| 1652 | 20 |
| 1653 | 20 |
| 1654 | 19.6 |
| 1655 | 19.6 |
| 1656 | 18 |
| 1657 | 18 |
| 1658 | 18 |
| 1659 | 18 |
| 1660 | 18 |
| 1661 | 19 |
| 1662 | 19 |
| 1663 | 19.6 |
| 1664 | 19.6 |
| 1665 | 19.6 |
| 1666 | 19.6 |
| 1667 | 19.8 |
| 1668 | 19.8 |
| 1669 | 20 |
| 1670 | 20 |
| 1671 | 20 |
| 1672 | 20 |
| 1673 | 20 |
| 1674 | 20 |
| 1675 | 20 |
| 1676 | 20 |
| 1677 | 20 |
| 1678 | 19.6 |
| 1679 | 19.6 |
| 1680 | 18 |
| 1681 | 18 |
| 1682 | 18 |
| 1683 | 18.8 |
| 1684 | 18.8 |
| 1685 | 19.6 |
| 1686 | 19.6 |
| 1687 | 19.6 |
| 1688 | 19.6 |
| 1689 | 19.6 |
| 1690 | 19.6 |
| 1691 | 19.6 |
| 1692 | 19.6 |
| 1693 | 19.6 |
| 1694 | 19.6 |
| 1695 | 20 |
| 1696 | 20 |
| 1697 | 20 |
| 1698 | 20 |
| 1699 | 20 |
| 1700 | 20 |
| 1701 | 19.6 |
| 1702 | 19.6 |
| 1703 | 19.4 |
| 1704 | 18 |
| 1705 | 18 |
| 1706 | 18 |
| 1707 | 18.8 |
| 1708 | 18.8 |
| 1709 | 19.6 |
| 1710 | 19.6 |
| 1711 | 19.6 |
| 1712 | 19.6 |
| 1713 | 19.6 |
| 1714 | 19.6 |
| 1715 | 19.6 |
| 1716 | 19.6 |
| 1717 | 19.6 |
| 1718 | 19.6 |
| 1719 | 20 |
| 1720 | 20 |
| 1721 | 20 |
| 1722 | 20 |
| 1723 | 20 |
| 1724 | 20 |
| 1725 | 19.6 |
| 1726 | 19.6 |
| 1727 | 19.4 |
| 1728 | 18 |
| 1729 | 18 |
| 1730 | 18 |
| 1731 | 18.8 |
| 1732 | 18.8 |
| 1733 | 19.6 |
| 1734 | 19.6 |
| 1735 | 19.6 |
| 1736 | 19.6 |
| 1737 | 19.6 |
| 1738 | 19.6 |
| 1739 | 19.6 |
| 1740 | 19.6 |
| 1741 | 19.6 |
| 1742 | 19.6 |
| 1743 | 20 |
| 1744 | 20 |
| 1745 | 20 |
| 1746 | 20 |
| 1747 | 20 |
| 1748 | 20 |
| 1749 | 19.6 |
| 1750 | 19.6 |
| 1751 | 19.4 |
| 1752 | 18 |
| 1753 | 18 |
| 1754 | 18 |
| 1755 | 18.8 |
| 1756 | 18.8 |
| 1757 | 19.6 |
| 1758 | 19.6 |
| 1759 | 19.6 |
| 1760 | 19.6 |
| 1761 | 19.6 |
| 1762 | 19.6 |
| 1763 | 19.6 |
| 1764 | 19.6 |
| 1765 | 19.6 |
| 1766 | 19.6 |
| 1767 | 20 |
| 1768 | 20 |
| 1769 | 20 |
| 1770 | 20 |
| 1771 | 20 |
| 1772 | 20 |
| 1773 | 19.6 |
| 1774 | 19.6 |
| 1775 | 19.4 |
| 1776 | 40.5 |
| 1777 | 40.5 |
| 1778 | 40.5 |
| 1779 | 42.3 |
| 1780 | 42.3 |
| 1781 | 44.1 |
| 1782 | 44.1 |
| 1783 | 44.1 |
| 1784 | 44.1 |
| 1785 | 44.1 |
| 1786 | 44.1 |
| 1787 | 44.1 |
| 1788 | 44.1 |
| 1789 | 44.1 |
| 1790 | 44.1 |
| 1791 | 45 |
| 1792 | 45 |
| 1793 | 45 |
| 1794 | 45 |
| 1795 | 45 |
| 1796 | 45 |
| 1797 | 44.1 |
| 1798 | 44.1 |
| 1799 | 43.65 |
| 1800 | 40.5 |
| 1801 | 40.5 |
| 1802 | 40.5 |
| 1803 | 40.5 |
| 1804 | 40.5 |
| 1805 | 42.75 |
| 1806 | 42.75 |
| 1807 | 44.1 |
| 1808 | 44.1 |
| 1809 | 44.1 |
| 1810 | 44.1 |
| 1811 | 44.55 |
| 1812 | 44.55 |
| 1813 | 45 |
| 1814 | 45 |
| 1815 | 45 |
| 1816 | 45 |
| 1817 | 45 |
| 1818 | 45 |
| 1819 | 45 |
| 1820 | 45 |
| 1821 | 45 |
| 1822 | 44.1 |
| 1823 | 44.1 |
| 1824 | 40.5 |
| 1825 | 40.5 |
| 1826 | 40.5 |
| 1827 | 40.5 |
| 1828 | 40.5 |
| 1829 | 42.75 |
| 1830 | 42.75 |
| 1831 | 44.1 |
| 1832 | 44.1 |
| 1833 | 44.1 |
| 1834 | 44.1 |
| 1835 | 44.55 |
| 1836 | 44.55 |
| 1837 | 45 |
| 1838 | 45 |
| 1839 | 45 |
| 1840 | 45 |
| 1841 | 45 |
| 1842 | 45 |
| 1843 | 45 |
| 1844 | 45 |
| 1845 | 45 |
| 1846 | 44.1 |
| 1847 | 44.1 |
| 1848 | 40.5 |
| 1849 | 40.5 |
| 1850 | 40.5 |
| 1851 | 42.3 |
| 1852 | 42.3 |
| 1853 | 44.1 |
| 1854 | 44.1 |
| 1855 | 44.1 |
| 1856 | 44.1 |
| 1857 | 44.1 |
| 1858 | 44.1 |
| 1859 | 44.1 |
| 1860 | 44.1 |
| 1861 | 44.1 |
| 1862 | 44.1 |
| 1863 | 45 |
| 1864 | 45 |
| 1865 | 45 |
| 1866 | 45 |
| 1867 | 45 |
| 1868 | 45 |
| 1869 | 44.1 |
| 1870 | 44.1 |
| 1871 | 43.65 |
| 1872 | 40.5 |
| 1873 | 40.5 |
| 1874 | 40.5 |
| 1875 | 42.3 |
| 1876 | 42.3 |
| 1877 | 44.1 |
| 1878 | 44.1 |
| 1879 | 44.1 |
| 1880 | 44.1 |
| 1881 | 44.1 |
| 1882 | 44.1 |
| 1883 | 44.1 |
| 1884 | 44.1 |
| 1885 | 44.1 |
| 1886 | 44.1 |
| 1887 | 45 |
| 1888 | 45 |
| 1889 | 45 |
| 1890 | 45 |
| 1891 | 45 |
| 1892 | 45 |
| 1893 | 44.1 |
| 1894 | 44.1 |
| 1895 | 43.65 |
| 1896 | 40.5 |
| 1897 | 40.5 |
| 1898 | 40.5 |
| 1899 | 42.3 |
| 1900 | 42.3 |
| 1901 | 44.1 |
| 1902 | 44.1 |
| 1903 | 44.1 |
| 1904 | 44.1 |
| 1905 | 44.1 |
| 1906 | 44.1 |
| 1907 | 44.1 |
| 1908 | 44.1 |
| 1909 | 44.1 |
| 1910 | 44.1 |
| 1911 | 45 |
| 1912 | 45 |
| 1913 | 45 |
| 1914 | 45 |
| 1915 | 45 |
| 1916 | 45 |
| 1917 | 44.1 |
| 1918 | 44.1 |
| 1919 | 43.65 |
| 1920 | 40.5 |
| 1921 | 40.5 |
| 1922 | 40.5 |
| 1923 | 42.3 |
| 1924 | 42.3 |
| 1925 | 44.1 |
| 1926 | 44.1 |
| 1927 | 44.1 |
| 1928 | 44.1 |
| 1929 | 44.1 |
| 1930 | 44.1 |
| 1931 | 44.1 |
| 1932 | 44.1 |
| 1933 | 44.1 |
| 1934 | 44.1 |
| 1935 | 45 |
| 1936 | 45 |
| 1937 | 45 |
| 1938 | 45 |
| 1939 | 45 |
| 1940 | 45 |
| 1941 | 44.1 |
| 1942 | 44.1 |
| 1943 | 43.65 |
| 1944 | 40.5 |
| 1945 | 40.5 |
| 1946 | 40.5 |
| 1947 | 42.3 |
| 1948 | 42.3 |
| 1949 | 44.1 |
| 1950 | 44.1 |
| 1951 | 44.1 |
| 1952 | 44.1 |
| 1953 | 44.1 |
| 1954 | 44.1 |
| 1955 | 44.1 |
| 1956 | 44.1 |
| 1957 | 44.1 |
| 1958 | 44.1 |
| 1959 | 45 |
| 1960 | 45 |
| 1961 | 45 |
| 1962 | 45 |
| 1963 | 45 |
| 1964 | 45 |
| 1965 | 44.1 |
| 1966 | 44.1 |
| 1967 | 43.65 |
| 1968 | 40.5 |
| 1969 | 40.5 |
| 1970 | 40.5 |
| 1971 | 40.5 |
| 1972 | 40.5 |
| 1973 | 42.75 |
| 1974 | 42.75 |
| 1975 | 44.1 |
| 1976 | 44.1 |
| 1977 | 44.1 |
| 1978 | 44.1 |
| 1979 | 44.55 |
| 1980 | 44.55 |
| 1981 | 45 |
| 1982 | 45 |
| 1983 | 45 |
| 1984 | 45 |
| 1985 | 45 |
| 1986 | 45 |
| 1987 | 45 |
| 1988 | 45 |
| 1989 | 45 |
| 1990 | 44.1 |
| 1991 | 44.1 |
| 1992 | 40.5 |
| 1993 | 40.5 |
| 1994 | 40.5 |
| 1995 | 40.5 |
| 1996 | 40.5 |
| 1997 | 42.75 |
| 1998 | 42.75 |
| 1999 | 44.1 |
| 2000 | 44.1 |
| 2001 | 44.1 |
| 2002 | 44.1 |
| 2003 | 44.55 |
| 2004 | 44.55 |
| 2005 | 45 |
| 2006 | 45 |
| 2007 | 45 |
| 2008 | 45 |
| 2009 | 45 |
| 2010 | 45 |
| 2011 | 45 |
| 2012 | 45 |
| 2013 | 45 |
| 2014 | 44.1 |
| 2015 | 44.1 |
| 2016 | 40.5 |
| 2017 | 40.5 |
| 2018 | 40.5 |
| 2019 | 42.3 |
| 2020 | 42.3 |
| 2021 | 44.1 |
| 2022 | 44.1 |
| 2023 | 44.1 |
| 2024 | 44.1 |
| 2025 | 44.1 |
| 2026 | 44.1 |
| 2027 | 44.1 |
| 2028 | 44.1 |
| 2029 | 44.1 |
| 2030 | 44.1 |
| 2031 | 45 |
| 2032 | 45 |
| 2033 | 45 |
| 2034 | 45 |
| 2035 | 45 |
| 2036 | 45 |
| 2037 | 44.1 |
| 2038 | 44.1 |
| 2039 | 43.65 |
| 2040 | 40.5 |
| 2041 | 40.5 |
| 2042 | 40.5 |
| 2043 | 42.3 |
| 2044 | 42.3 |
| 2045 | 44.1 |
| 2046 | 44.1 |
| 2047 | 44.1 |
| 2048 | 44.1 |
| 2049 | 44.1 |
| 2050 | 44.1 |
| 2051 | 44.1 |
| 2052 | 44.1 |
| 2053 | 44.1 |
| 2054 | 44.1 |
| 2055 | 45 |
| 2056 | 45 |
| 2057 | 45 |
| 2058 | 45 |
| 2059 | 45 |
| 2060 | 45 |
| 2061 | 44.1 |
| 2062 | 44.1 |
| 2063 | 43.65 |
| 2064 | 40.5 |
| 2065 | 40.5 |
| 2066 | 40.5 |
| 2067 | 42.3 |
| 2068 | 42.3 |
| 2069 | 44.1 |
| 2070 | 44.1 |
| 2071 | 44.1 |
| 2072 | 44.1 |
| 2073 | 44.1 |
| 2074 | 44.1 |
| 2075 | 44.1 |
| 2076 | 44.1 |
| 2077 | 44.1 |
| 2078 | 44.1 |
| 2079 | 45 |
| 2080 | 45 |
| 2081 | 45 |
| 2082 | 45 |
| 2083 | 45 |
| 2084 | 45 |
| 2085 | 44.1 |
| 2086 | 44.1 |
| 2087 | 43.65 |
| 2088 | 40.5 |
| 2089 | 40.5 |
| 2090 | 40.5 |
| 2091 | 42.3 |
| 2092 | 42.3 |
| 2093 | 44.1 |
| 2094 | 44.1 |
| 2095 | 44.1 |
| 2096 | 44.1 |
| 2097 | 44.1 |
| 2098 | 44.1 |
| 2099 | 44.1 |
| 2100 | 44.1 |
| 2101 | 44.1 |
| 2102 | 44.1 |
| 2103 | 45 |
| 2104 | 45 |
| 2105 | 45 |
| 2106 | 45 |
| 2107 | 45 |
| 2108 | 45 |
| 2109 | 44.1 |
| 2110 | 44.1 |
| 2111 | 43.65 |
| 2112 | 40.5 |
| 2113 | 40.5 |
| 2114 | 40.5 |
| 2115 | 42.3 |
| 2116 | 42.3 |
| 2117 | 44.1 |
| 2118 | 44.1 |
| 2119 | 44.1 |
| 2120 | 44.1 |
| 2121 | 44.1 |
| 2122 | 44.1 |
| 2123 | 44.1 |
| 2124 | 44.1 |
| 2125 | 44.1 |
| 2126 | 44.1 |
| 2127 | 45 |
| 2128 | 45 |
| 2129 | 45 |
| 2130 | 45 |
| 2131 | 45 |
| 2132 | 45 |
| 2133 | 44.1 |
| 2134 | 44.1 |
| 2135 | 43.65 |
| 2136 | 40.5 |
| 2137 | 40.5 |
| 2138 | 40.5 |
| 2139 | 40.5 |
| 2140 | 40.5 |
| 2141 | 42.75 |
| 2142 | 42.75 |
| 2143 | 44.1 |
| 2144 | 44.1 |
| 2145 | 44.1 |
| 2146 | 44.1 |
| 2147 | 44.55 |
| 2148 | 44.55 |
| 2149 | 45 |
| 2150 | 45 |
| 2151 | 45 |
| 2152 | 45 |
| 2153 | 45 |
| 2154 | 45 |
| 2155 | 45 |
| 2156 | 45 |
| 2157 | 45 |
| 2158 | 44.1 |
| 2159 | 44.1 |
| 2160 | 40.5 |
| 2161 | 40.5 |
| 2162 | 40.5 |
| 2163 | 40.5 |
| 2164 | 40.5 |
| 2165 | 42.75 |
| 2166 | 42.75 |
| 2167 | 44.1 |
| 2168 | 44.1 |
| 2169 | 44.1 |
| 2170 | 44.1 |
| 2171 | 44.55 |
| 2172 | 44.55 |
| 2173 | 45 |
| 2174 | 45 |
| 2175 | 45 |
| 2176 | 45 |
| 2177 | 45 |
| 2178 | 45 |
| 2179 | 45 |
| 2180 | 45 |
| 2181 | 45 |
| 2182 | 44.1 |
| 2183 | 44.1 |
| 2184 | 40.5 |
| 2185 | 40.5 |
| 2186 | 40.5 |
| 2187 | 42.3 |
| 2188 | 42.3 |
| 2189 | 44.1 |
| 2190 | 44.1 |
| 2191 | 44.1 |
| 2192 | 44.1 |
| 2193 | 44.1 |
| 2194 | 44.1 |
| 2195 | 44.1 |
| 2196 | 44.1 |
| 2197 | 44.1 |
| 2198 | 44.1 |
| 2199 | 45 |
| 2200 | 45 |
| 2201 | 45 |
| 2202 | 45 |
| 2203 | 45 |
| 2204 | 45 |
| 2205 | 44.1 |
| 2206 | 44.1 |
| 2207 | 43.65 |
| 2208 | 40.5 |
| 2209 | 40.5 |
| 2210 | 40.5 |
| 2211 | 42.3 |
| 2212 | 42.3 |
| 2213 | 44.1 |
| 2214 | 44.1 |
| 2215 | 44.1 |
| 2216 | 44.1 |
| 2217 | 44.1 |
| 2218 | 44.1 |
| 2219 | 44.1 |
| 2220 | 44.1 |
| 2221 | 44.1 |
| 2222 | 44.1 |
| 2223 | 45 |
| 2224 | 45 |
| 2225 | 45 |
| 2226 | 45 |
| 2227 | 45 |
| 2228 | 45 |
| 2229 | 44.1 |
| 2230 | 44.1 |
| 2231 | 43.65 |
| 2232 | 40.5 |
| 2233 | 40.5 |
| 2234 | 40.5 |
| 2235 | 42.3 |
| 2236 | 42.3 |
| 2237 | 44.1 |
| 2238 | 44.1 |
| 2239 | 44.1 |
| 2240 | 44.1 |
| 2241 | 44.1 |
| 2242 | 44.1 |
| 2243 | 44.1 |
| 2244 | 44.1 |
| 2245 | 44.1 |
| 2246 | 44.1 |
| 2247 | 45 |
| 2248 | 45 |
| 2249 | 45 |
| 2250 | 45 |
| 2251 | 45 |
| 2252 | 45 |
| 2253 | 44.1 |
| 2254 | 44.1 |
| 2255 | 43.65 |
| 2256 | 40.5 |
| 2257 | 40.5 |
| 2258 | 40.5 |
| 2259 | 42.3 |
| 2260 | 42.3 |
| 2261 | 44.1 |
| 2262 | 44.1 |
| 2263 | 44.1 |
| 2264 | 44.1 |
| 2265 | 44.1 |
| 2266 | 44.1 |
| 2267 | 44.1 |
| 2268 | 44.1 |
| 2269 | 44.1 |
| 2270 | 44.1 |
| 2271 | 45 |
| 2272 | 45 |
| 2273 | 45 |
| 2274 | 45 |
| 2275 | 45 |
| 2276 | 45 |
| 2277 | 44.1 |
| 2278 | 44.1 |
| 2279 | 43.65 |
| 2280 | 40.5 |
| 2281 | 40.5 |
| 2282 | 40.5 |
| 2283 | 42.3 |
| 2284 | 42.3 |
| 2285 | 44.1 |
| 2286 | 44.1 |
| 2287 | 44.1 |
| 2288 | 44.1 |
| 2289 | 44.1 |
| 2290 | 44.1 |
| 2291 | 44.1 |
| 2292 | 44.1 |
| 2293 | 44.1 |
| 2294 | 44.1 |
| 2295 | 45 |
| 2296 | 45 |
| 2297 | 45 |
| 2298 | 45 |
| 2299 | 45 |
| 2300 | 45 |
| 2301 | 44.1 |
| 2302 | 44.1 |
| 2303 | 43.65 |
| 2304 | 40.5 |
| 2305 | 40.5 |
| 2306 | 40.5 |
| 2307 | 40.5 |
| 2308 | 40.5 |
| 2309 | 42.75 |
| 2310 | 42.75 |
| 2311 | 44.1 |
| 2312 | 44.1 |
| 2313 | 44.1 |
| 2314 | 44.1 |
| 2315 | 44.55 |
| 2316 | 44.55 |
| 2317 | 45 |
| 2318 | 45 |
| 2319 | 45 |
| 2320 | 45 |
| 2321 | 45 |
| 2322 | 45 |
| 2323 | 45 |
| 2324 | 45 |
| 2325 | 45 |
| 2326 | 44.1 |
| 2327 | 44.1 |
| 2328 | 40.5 |
| 2329 | 40.5 |
| 2330 | 40.5 |
| 2331 | 40.5 |
| 2332 | 40.5 |
| 2333 | 42.75 |
| 2334 | 42.75 |
| 2335 | 44.1 |
| 2336 | 44.1 |
| 2337 | 44.1 |
| 2338 | 44.1 |
| 2339 | 44.55 |
| 2340 | 44.55 |
| 2341 | 45 |
| 2342 | 45 |
| 2343 | 45 |
| 2344 | 45 |
| 2345 | 45 |
| 2346 | 45 |
| 2347 | 45 |
| 2348 | 45 |
| 2349 | 45 |
| 2350 | 44.1 |
| 2351 | 44.1 |
| 2352 | 40.5 |
| 2353 | 40.5 |
| 2354 | 40.5 |
| 2355 | 42.3 |
| 2356 | 42.3 |
| 2357 | 44.1 |
| 2358 | 44.1 |
| 2359 | 44.1 |
| 2360 | 44.1 |
| 2361 | 44.1 |
| 2362 | 44.1 |
| 2363 | 44.1 |
| 2364 | 44.1 |
| 2365 | 44.1 |
| 2366 | 44.1 |
| 2367 | 45 |
| 2368 | 45 |
| 2369 | 45 |
| 2370 | 45 |
| 2371 | 45 |
| 2372 | 45 |
| 2373 | 44.1 |
| 2374 | 44.1 |
| 2375 | 43.65 |
| 2376 | 40.5 |
| 2377 | 40.5 |
| 2378 | 40.5 |
| 2379 | 42.3 |
| 2380 | 42.3 |
| 2381 | 44.1 |
| 2382 | 44.1 |
| 2383 | 44.1 |
| 2384 | 44.1 |
| 2385 | 44.1 |
| 2386 | 44.1 |
| 2387 | 44.1 |
| 2388 | 44.1 |
| 2389 | 44.1 |
| 2390 | 44.1 |
| 2391 | 45 |
| 2392 | 45 |
| 2393 | 45 |
| 2394 | 45 |
| 2395 | 45 |
| 2396 | 45 |
| 2397 | 44.1 |
| 2398 | 44.1 |
| 2399 | 43.65 |
| 2400 | 40.5 |
| 2401 | 40.5 |
| 2402 | 40.5 |
| 2403 | 42.3 |
| 2404 | 42.3 |
| 2405 | 44.1 |
| 2406 | 44.1 |
| 2407 | 44.1 |
| 2408 | 44.1 |
| 2409 | 44.1 |
| 2410 | 44.1 |
| 2411 | 44.1 |
| 2412 | 44.1 |
| 2413 | 44.1 |
| 2414 | 44.1 |
| 2415 | 45 |
| 2416 | 45 |
| 2417 | 45 |
| 2418 | 45 |
| 2419 | 45 |
| 2420 | 45 |
| 2421 | 44.1 |
| 2422 | 44.1 |
| 2423 | 43.65 |
| 2424 | 40.5 |
| 2425 | 40.5 |
| 2426 | 40.5 |
| 2427 | 42.3 |
| 2428 | 42.3 |
| 2429 | 44.1 |
| 2430 | 44.1 |
| 2431 | 44.1 |
| 2432 | 44.1 |
| 2433 | 44.1 |
| 2434 | 44.1 |
| 2435 | 44.1 |
| 2436 | 44.1 |
| 2437 | 44.1 |
| 2438 | 44.1 |
| 2439 | 45 |
| 2440 | 45 |
| 2441 | 45 |
| 2442 | 45 |
| 2443 | 45 |
| 2444 | 45 |
| 2445 | 44.1 |
| 2446 | 44.1 |
| 2447 | 43.65 |
| 2448 | 40.5 |
| 2449 | 40.5 |
| 2450 | 40.5 |
| 2451 | 42.3 |
| 2452 | 42.3 |
| 2453 | 44.1 |
| 2454 | 44.1 |
| 2455 | 44.1 |
| 2456 | 44.1 |
| 2457 | 44.1 |
| 2458 | 44.1 |
| 2459 | 44.1 |
| 2460 | 44.1 |
| 2461 | 44.1 |
| 2462 | 44.1 |
| 2463 | 45 |
| 2464 | 45 |
| 2465 | 45 |
| 2466 | 45 |
| 2467 | 45 |
| 2468 | 45 |
| 2469 | 44.1 |
| 2470 | 44.1 |
| 2471 | 43.65 |
| 2472 | 40.5 |
| 2473 | 40.5 |
| 2474 | 40.5 |
| 2475 | 40.5 |
| 2476 | 40.5 |
| 2477 | 42.75 |
| 2478 | 42.75 |
| 2479 | 44.1 |
| 2480 | 44.1 |
| 2481 | 44.1 |
| 2482 | 44.1 |
| 2483 | 44.55 |
| 2484 | 44.55 |
| 2485 | 45 |
| 2486 | 45 |
| 2487 | 45 |
| 2488 | 45 |
| 2489 | 45 |
| 2490 | 45 |
| 2491 | 45 |
| 2492 | 45 |
| 2493 | 45 |
| 2494 | 44.1 |
| 2495 | 44.1 |
| 2496 | 40.5 |
| 2497 | 40.5 |
| 2498 | 40.5 |
| 2499 | 40.5 |
| 2500 | 40.5 |
| 2501 | 42.75 |
| 2502 | 42.75 |
| 2503 | 44.1 |
| 2504 | 44.1 |
| 2505 | 44.1 |
| 2506 | 44.1 |
| 2507 | 44.55 |
| 2508 | 44.55 |
| 2509 | 45 |
| 2510 | 45 |
| 2511 | 45 |
| 2512 | 45 |
| 2513 | 45 |
| 2514 | 45 |
| 2515 | 45 |
| 2516 | 45 |
| 2517 | 45 |
| 2518 | 44.1 |
| 2519 | 44.1 |
| 2520 | 40.5 |
| 2521 | 40.5 |
| 2522 | 40.5 |
| 2523 | 42.3 |
| 2524 | 42.3 |
| 2525 | 44.1 |
| 2526 | 44.1 |
| 2527 | 44.1 |
| 2528 | 44.1 |
| 2529 | 44.1 |
| 2530 | 44.1 |
| 2531 | 44.1 |
| 2532 | 44.1 |
| 2533 | 44.1 |
| 2534 | 44.1 |
| 2535 | 45 |
| 2536 | 45 |
| 2537 | 45 |
| 2538 | 45 |
| 2539 | 45 |
| 2540 | 45 |
| 2541 | 44.1 |
| 2542 | 44.1 |
| 2543 | 43.65 |
| 2544 | 40.5 |
| 2545 | 40.5 |
| 2546 | 40.5 |
| 2547 | 42.3 |
| 2548 | 42.3 |
| 2549 | 44.1 |
| 2550 | 44.1 |
| 2551 | 44.1 |
| 2552 | 44.1 |
| 2553 | 44.1 |
| 2554 | 44.1 |
| 2555 | 44.1 |
| 2556 | 44.1 |
| 2557 | 44.1 |
| 2558 | 44.1 |
| 2559 | 45 |
| 2560 | 45 |
| 2561 | 45 |
| 2562 | 45 |
| 2563 | 45 |
| 2564 | 45 |
| 2565 | 44.1 |
| 2566 | 44.1 |
| 2567 | 43.65 |
| 2568 | 40.5 |
| 2569 | 40.5 |
| 2570 | 40.5 |
| 2571 | 42.3 |
| 2572 | 42.3 |
| 2573 | 44.1 |
| 2574 | 44.1 |
| 2575 | 44.1 |
| 2576 | 44.1 |
| 2577 | 44.1 |
| 2578 | 44.1 |
| 2579 | 44.1 |
| 2580 | 44.1 |
| 2581 | 44.1 |
| 2582 | 44.1 |
| 2583 | 45 |
| 2584 | 45 |
| 2585 | 45 |
| 2586 | 45 |
| 2587 | 45 |
| 2588 | 45 |
| 2589 | 44.1 |
| 2590 | 44.1 |
| 2591 | 43.65 |
| 2592 | 40.5 |
| 2593 | 40.5 |
| 2594 | 40.5 |
| 2595 | 42.3 |
| 2596 | 42.3 |
| 2597 | 44.1 |
| 2598 | 44.1 |
| 2599 | 44.1 |
| 2600 | 44.1 |
| 2601 | 44.1 |
| 2602 | 44.1 |
| 2603 | 44.1 |
| 2604 | 44.1 |
| 2605 | 44.1 |
| 2606 | 44.1 |
| 2607 | 45 |
| 2608 | 45 |
| 2609 | 45 |
| 2610 | 45 |
| 2611 | 45 |
| 2612 | 45 |
| 2613 | 44.1 |
| 2614 | 44.1 |
| 2615 | 43.65 |
| 2616 | 40.5 |
| 2617 | 40.5 |
| 2618 | 40.5 |
| 2619 | 42.3 |
| 2620 | 42.3 |
| 2621 | 44.1 |
| 2622 | 44.1 |
| 2623 | 44.1 |
| 2624 | 44.1 |
| 2625 | 44.1 |
| 2626 | 44.1 |
| 2627 | 44.1 |
| 2628 | 44.1 |
| 2629 | 44.1 |
| 2630 | 44.1 |
| 2631 | 45 |
| 2632 | 45 |
| 2633 | 45 |
| 2634 | 45 |
| 2635 | 45 |
| 2636 | 45 |
| 2637 | 44.1 |
| 2638 | 44.1 |
| 2639 | 43.65 |
| 2640 | 40.5 |
| 2641 | 40.5 |
| 2642 | 40.5 |
| 2643 | 40.5 |
| 2644 | 40.5 |
| 2645 | 42.75 |
| 2646 | 42.75 |
| 2647 | 44.1 |
| 2648 | 44.1 |
| 2649 | 44.1 |
| 2650 | 44.1 |
| 2651 | 44.55 |
| 2652 | 44.55 |
| 2653 | 45 |
| 2654 | 45 |
| 2655 | 45 |
| 2656 | 45 |
| 2657 | 45 |
| 2658 | 45 |
| 2659 | 45 |
| 2660 | 45 |
| 2661 | 45 |
| 2662 | 44.1 |
| 2663 | 44.1 |
| 2664 | 40.5 |
| 2665 | 40.5 |
| 2666 | 40.5 |
| 2667 | 40.5 |
| 2668 | 40.5 |
| 2669 | 42.75 |
| 2670 | 42.75 |
| 2671 | 44.1 |
| 2672 | 44.1 |
| 2673 | 44.1 |
| 2674 | 44.1 |
| 2675 | 44.55 |
| 2676 | 44.55 |
| 2677 | 45 |
| 2678 | 45 |
| 2679 | 45 |
| 2680 | 45 |
| 2681 | 45 |
| 2682 | 45 |
| 2683 | 45 |
| 2684 | 45 |
| 2685 | 45 |
| 2686 | 44.1 |
| 2687 | 44.1 |
| 2688 | 40.5 |
| 2689 | 40.5 |
| 2690 | 40.5 |
| 2691 | 42.3 |
| 2692 | 42.3 |
| 2693 | 44.1 |
| 2694 | 44.1 |
| 2695 | 44.1 |
| 2696 | 44.1 |
| 2697 | 44.1 |
| 2698 | 44.1 |
| 2699 | 44.1 |
| 2700 | 44.1 |
| 2701 | 44.1 |
| 2702 | 44.1 |
| 2703 | 45 |
| 2704 | 45 |
| 2705 | 45 |
| 2706 | 45 |
| 2707 | 45 |
| 2708 | 45 |
| 2709 | 44.1 |
| 2710 | 44.1 |
| 2711 | 43.65 |
| 2712 | 40.5 |
| 2713 | 40.5 |
| 2714 | 40.5 |
| 2715 | 42.3 |
| 2716 | 42.3 |
| 2717 | 44.1 |
| 2718 | 44.1 |
| 2719 | 44.1 |
| 2720 | 44.1 |
| 2721 | 44.1 |
| 2722 | 44.1 |
| 2723 | 44.1 |
| 2724 | 44.1 |
| 2725 | 44.1 |
| 2726 | 44.1 |
| 2727 | 45 |
| 2728 | 45 |
| 2729 | 45 |
| 2730 | 45 |
| 2731 | 45 |
| 2732 | 45 |
| 2733 | 44.1 |
| 2734 | 44.1 |
| 2735 | 43.65 |
| 2736 | 40.5 |
| 2737 | 40.5 |
| 2738 | 40.5 |
| 2739 | 42.3 |
| 2740 | 42.3 |
| 2741 | 44.1 |
| 2742 | 44.1 |
| 2743 | 44.1 |
| 2744 | 44.1 |
| 2745 | 44.1 |
| 2746 | 44.1 |
| 2747 | 44.1 |
| 2748 | 44.1 |
| 2749 | 44.1 |
| 2750 | 44.1 |
| 2751 | 45 |
| 2752 | 45 |
| 2753 | 45 |
| 2754 | 45 |
| 2755 | 45 |
| 2756 | 45 |
| 2757 | 44.1 |
| 2758 | 44.1 |
| 2759 | 43.65 |
| 2760 | 40.5 |
| 2761 | 40.5 |
| 2762 | 40.5 |
| 2763 | 42.3 |
| 2764 | 42.3 |
| 2765 | 44.1 |
| 2766 | 44.1 |
| 2767 | 44.1 |
| 2768 | 44.1 |
| 2769 | 44.1 |
| 2770 | 44.1 |
| 2771 | 44.1 |
| 2772 | 44.1 |
| 2773 | 44.1 |
| 2774 | 44.1 |
| 2775 | 45 |
| 2776 | 45 |
| 2777 | 45 |
| 2778 | 45 |
| 2779 | 45 |
| 2780 | 45 |
| 2781 | 44.1 |
| 2782 | 44.1 |
| 2783 | 43.65 |
| 2784 | 40.5 |
| 2785 | 40.5 |
| 2786 | 40.5 |
| 2787 | 42.3 |
| 2788 | 42.3 |
| 2789 | 44.1 |
| 2790 | 44.1 |
| 2791 | 44.1 |
| 2792 | 44.1 |
| 2793 | 44.1 |
| 2794 | 44.1 |
| 2795 | 44.1 |
| 2796 | 44.1 |
| 2797 | 44.1 |
| 2798 | 44.1 |
| 2799 | 45 |
| 2800 | 45 |
| 2801 | 45 |
| 2802 | 45 |
| 2803 | 45 |
| 2804 | 45 |
| 2805 | 44.1 |
| 2806 | 44.1 |
| 2807 | 43.65 |
| 2808 | 40.5 |
| 2809 | 40.5 |
| 2810 | 40.5 |
| 2811 | 40.5 |
| 2812 | 40.5 |
| 2813 | 42.75 |
| 2814 | 42.75 |
| 2815 | 44.1 |
| 2816 | 44.1 |
| 2817 | 44.1 |
| 2818 | 44.1 |
| 2819 | 44.55 |
| 2820 | 44.55 |
| 2821 | 45 |
| 2822 | 45 |
| 2823 | 45 |
| 2824 | 45 |
| 2825 | 45 |
| 2826 | 45 |
| 2827 | 45 |
| 2828 | 45 |
| 2829 | 45 |
| 2830 | 44.1 |
| 2831 | 44.1 |
| 2832 | 40.5 |
| 2833 | 40.5 |
| 2834 | 40.5 |
| 2835 | 40.5 |
| 2836 | 40.5 |
| 2837 | 42.75 |
| 2838 | 42.75 |
| 2839 | 44.1 |
| 2840 | 44.1 |
| 2841 | 44.1 |
| 2842 | 44.1 |
| 2843 | 44.55 |
| 2844 | 44.55 |
| 2845 | 45 |
| 2846 | 45 |
| 2847 | 45 |
| 2848 | 45 |
| 2849 | 45 |
| 2850 | 45 |
| 2851 | 45 |
| 2852 | 45 |
| 2853 | 45 |
| 2854 | 44.1 |
| 2855 | 44.1 |
| 2856 | 40.5 |
| 2857 | 40.5 |
| 2858 | 40.5 |
| 2859 | 42.3 |
| 2860 | 42.3 |
| 2861 | 44.1 |
| 2862 | 44.1 |
| 2863 | 44.1 |
| 2864 | 44.1 |
| 2865 | 44.1 |
| 2866 | 44.1 |
| 2867 | 44.1 |
| 2868 | 44.1 |
| 2869 | 44.1 |
| 2870 | 44.1 |
| 2871 | 45 |
| 2872 | 45 |
| 2873 | 45 |
| 2874 | 45 |
| 2875 | 45 |
| 2876 | 45 |
| 2877 | 44.1 |
| 2878 | 44.1 |
| 2879 | 43.65 |
| 2880 | 40.5 |
| 2881 | 40.5 |
| 2882 | 40.5 |
| 2883 | 42.3 |
| 2884 | 42.3 |
| 2885 | 44.1 |
| 2886 | 44.1 |
| 2887 | 44.1 |
| 2888 | 44.1 |
| 2889 | 44.1 |
| 2890 | 44.1 |
| 2891 | 44.1 |
| 2892 | 44.1 |
| 2893 | 44.1 |
| 2894 | 44.1 |
| 2895 | 45 |
| 2896 | 45 |
| 2897 | 45 |
| 2898 | 45 |
| 2899 | 45 |
| 2900 | 45 |
| 2901 | 44.1 |
| 2902 | 44.1 |
| 2903 | 43.65 |
| 2904 | 40.5 |
| 2905 | 40.5 |
| 2906 | 40.5 |
| 2907 | 42.3 |
| 2908 | 42.3 |
| 2909 | 44.1 |
| 2910 | 44.1 |
| 2911 | 44.1 |
| 2912 | 44.1 |
| 2913 | 44.1 |
| 2914 | 44.1 |
| 2915 | 44.1 |
| 2916 | 44.1 |
| 2917 | 44.1 |
| 2918 | 44.1 |
| 2919 | 45 |
| 2920 | 45 |
| 2921 | 45 |
| 2922 | 45 |
| 2923 | 45 |
| 2924 | 45 |
| 2925 | 44.1 |
| 2926 | 44.1 |
| 2927 | 43.65 |
| 2928 | 67.5 |
| 2929 | 67.5 |
| 2930 | 67.5 |
| 2931 | 70.5 |
| 2932 | 70.5 |
| 2933 | 73.5 |
| 2934 | 73.5 |
| 2935 | 73.5 |
| 2936 | 73.5 |
| 2937 | 73.5 |
| 2938 | 73.5 |
| 2939 | 73.5 |
| 2940 | 73.5 |
| 2941 | 73.5 |
| 2942 | 73.5 |
| 2943 | 75 |
| 2944 | 75 |
| 2945 | 75 |
| 2946 | 75 |
| 2947 | 75 |
| 2948 | 75 |
| 2949 | 73.5 |
| 2950 | 73.5 |
| 2951 | 72.75 |
| 2952 | 67.5 |
| 2953 | 67.5 |
| 2954 | 67.5 |
| 2955 | 70.5 |
| 2956 | 70.5 |
| 2957 | 73.5 |
| 2958 | 73.5 |
| 2959 | 73.5 |
| 2960 | 73.5 |
| 2961 | 73.5 |
| 2962 | 73.5 |
| 2963 | 73.5 |
| 2964 | 73.5 |
| 2965 | 73.5 |
| 2966 | 73.5 |
| 2967 | 75 |
| 2968 | 75 |
| 2969 | 75 |
| 2970 | 75 |
| 2971 | 75 |
| 2972 | 75 |
| 2973 | 73.5 |
| 2974 | 73.5 |
| 2975 | 72.75 |
| 2976 | 67.5 |
| 2977 | 67.5 |
| 2978 | 67.5 |
| 2979 | 67.5 |
| 2980 | 67.5 |
| 2981 | 71.25 |
| 2982 | 71.25 |
| 2983 | 73.5 |
| 2984 | 73.5 |
| 2985 | 73.5 |
| 2986 | 73.5 |
| 2987 | 74.25 |
| 2988 | 74.25 |
| 2989 | 75 |
| 2990 | 75 |
| 2991 | 75 |
| 2992 | 75 |
| 2993 | 75 |
| 2994 | 75 |
| 2995 | 75 |
| 2996 | 75 |
| 2997 | 75 |
| 2998 | 73.5 |
| 2999 | 73.5 |
| 3000 | 67.5 |
| 3001 | 67.5 |
| 3002 | 67.5 |
| 3003 | 67.5 |
| 3004 | 67.5 |
| 3005 | 71.25 |
| 3006 | 71.25 |
| 3007 | 73.5 |
| 3008 | 73.5 |
| 3009 | 73.5 |
| 3010 | 73.5 |
| 3011 | 74.25 |
| 3012 | 74.25 |
| 3013 | 75 |
| 3014 | 75 |
| 3015 | 75 |
| 3016 | 75 |
| 3017 | 75 |
| 3018 | 75 |
| 3019 | 75 |
| 3020 | 75 |
| 3021 | 75 |
| 3022 | 73.5 |
| 3023 | 73.5 |
| 3024 | 67.5 |
| 3025 | 67.5 |
| 3026 | 67.5 |
| 3027 | 70.5 |
| 3028 | 70.5 |
| 3029 | 73.5 |
| 3030 | 73.5 |
| 3031 | 73.5 |
| 3032 | 73.5 |
| 3033 | 73.5 |
| 3034 | 73.5 |
| 3035 | 73.5 |
| 3036 | 73.5 |
| 3037 | 73.5 |
| 3038 | 73.5 |
| 3039 | 75 |
| 3040 | 75 |
| 3041 | 75 |
| 3042 | 75 |
| 3043 | 75 |
| 3044 | 75 |
| 3045 | 73.5 |
| 3046 | 73.5 |
| 3047 | 72.75 |
| 3048 | 67.5 |
| 3049 | 67.5 |
| 3050 | 67.5 |
| 3051 | 70.5 |
| 3052 | 70.5 |
| 3053 | 73.5 |
| 3054 | 73.5 |
| 3055 | 73.5 |
| 3056 | 73.5 |
| 3057 | 73.5 |
| 3058 | 73.5 |
| 3059 | 73.5 |
| 3060 | 73.5 |
| 3061 | 73.5 |
| 3062 | 73.5 |
| 3063 | 75 |
| 3064 | 75 |
| 3065 | 75 |
| 3066 | 75 |
| 3067 | 75 |
| 3068 | 75 |
| 3069 | 73.5 |
| 3070 | 73.5 |
| 3071 | 72.75 |
| 3072 | 67.5 |
| 3073 | 67.5 |
| 3074 | 67.5 |
| 3075 | 70.5 |
| 3076 | 70.5 |
| 3077 | 73.5 |
| 3078 | 73.5 |
| 3079 | 73.5 |
| 3080 | 73.5 |
| 3081 | 73.5 |
| 3082 | 73.5 |
| 3083 | 73.5 |
| 3084 | 73.5 |
| 3085 | 73.5 |
| 3086 | 73.5 |
| 3087 | 75 |
| 3088 | 75 |
| 3089 | 75 |
| 3090 | 75 |
| 3091 | 75 |
| 3092 | 75 |
| 3093 | 73.5 |
| 3094 | 73.5 |
| 3095 | 72.75 |
| 3096 | 67.5 |
| 3097 | 67.5 |
| 3098 | 67.5 |
| 3099 | 70.5 |
| 3100 | 70.5 |
| 3101 | 73.5 |
| 3102 | 73.5 |
| 3103 | 73.5 |
| 3104 | 73.5 |
| 3105 | 73.5 |
| 3106 | 73.5 |
| 3107 | 73.5 |
| 3108 | 73.5 |
| 3109 | 73.5 |
| 3110 | 73.5 |
| 3111 | 75 |
| 3112 | 75 |
| 3113 | 75 |
| 3114 | 75 |
| 3115 | 75 |
| 3116 | 75 |
| 3117 | 73.5 |
| 3118 | 73.5 |
| 3119 | 72.75 |
| 3120 | 67.5 |
| 3121 | 67.5 |
| 3122 | 67.5 |
| 3123 | 70.5 |
| 3124 | 70.5 |
| 3125 | 73.5 |
| 3126 | 73.5 |
| 3127 | 73.5 |
| 3128 | 73.5 |
| 3129 | 73.5 |
| 3130 | 73.5 |
| 3131 | 73.5 |
| 3132 | 73.5 |
| 3133 | 73.5 |
| 3134 | 73.5 |
| 3135 | 75 |
| 3136 | 75 |
| 3137 | 75 |
| 3138 | 75 |
| 3139 | 75 |
| 3140 | 75 |
| 3141 | 73.5 |
| 3142 | 73.5 |
| 3143 | 72.75 |
| 3144 | 67.5 |
| 3145 | 67.5 |
| 3146 | 67.5 |
| 3147 | 67.5 |
| 3148 | 67.5 |
| 3149 | 71.25 |
| 3150 | 71.25 |
| 3151 | 73.5 |
| 3152 | 73.5 |
| 3153 | 73.5 |
| 3154 | 73.5 |
| 3155 | 74.25 |
| 3156 | 74.25 |
| 3157 | 75 |
| 3158 | 75 |
| 3159 | 75 |
| 3160 | 75 |
| 3161 | 75 |
| 3162 | 75 |
| 3163 | 75 |
| 3164 | 75 |
| 3165 | 75 |
| 3166 | 73.5 |
| 3167 | 73.5 |
| 3168 | 67.5 |
| 3169 | 67.5 |
| 3170 | 67.5 |
| 3171 | 67.5 |
| 3172 | 67.5 |
| 3173 | 71.25 |
| 3174 | 71.25 |
| 3175 | 73.5 |
| 3176 | 73.5 |
| 3177 | 73.5 |
| 3178 | 73.5 |
| 3179 | 74.25 |
| 3180 | 74.25 |
| 3181 | 75 |
| 3182 | 75 |
| 3183 | 75 |
| 3184 | 75 |
| 3185 | 75 |
| 3186 | 75 |
| 3187 | 75 |
| 3188 | 75 |
| 3189 | 75 |
| 3190 | 73.5 |
| 3191 | 73.5 |
| 3192 | 67.5 |
| 3193 | 67.5 |
| 3194 | 67.5 |
| 3195 | 70.5 |
| 3196 | 70.5 |
| 3197 | 73.5 |
| 3198 | 73.5 |
| 3199 | 73.5 |
| 3200 | 73.5 |
| 3201 | 73.5 |
| 3202 | 73.5 |
| 3203 | 73.5 |
| 3204 | 73.5 |
| 3205 | 73.5 |
| 3206 | 73.5 |
| 3207 | 75 |
| 3208 | 75 |
| 3209 | 75 |
| 3210 | 75 |
| 3211 | 75 |
| 3212 | 75 |
| 3213 | 73.5 |
| 3214 | 73.5 |
| 3215 | 72.75 |
| 3216 | 67.5 |
| 3217 | 67.5 |
| 3218 | 67.5 |
| 3219 | 70.5 |
| 3220 | 70.5 |
| 3221 | 73.5 |
| 3222 | 73.5 |
| 3223 | 73.5 |
| 3224 | 73.5 |
| 3225 | 73.5 |
| 3226 | 73.5 |
| 3227 | 73.5 |
| 3228 | 73.5 |
| 3229 | 73.5 |
| 3230 | 73.5 |
| 3231 | 75 |
| 3232 | 75 |
| 3233 | 75 |
| 3234 | 75 |
| 3235 | 75 |
| 3236 | 75 |
| 3237 | 73.5 |
| 3238 | 73.5 |
| 3239 | 72.75 |
| 3240 | 67.5 |
| 3241 | 67.5 |
| 3242 | 67.5 |
| 3243 | 70.5 |
| 3244 | 70.5 |
| 3245 | 73.5 |
| 3246 | 73.5 |
| 3247 | 73.5 |
| 3248 | 73.5 |
| 3249 | 73.5 |
| 3250 | 73.5 |
| 3251 | 73.5 |
| 3252 | 73.5 |
| 3253 | 73.5 |
| 3254 | 73.5 |
| 3255 | 75 |
| 3256 | 75 |
| 3257 | 75 |
| 3258 | 75 |
| 3259 | 75 |
| 3260 | 75 |
| 3261 | 73.5 |
| 3262 | 73.5 |
| 3263 | 72.75 |
| 3264 | 67.5 |
| 3265 | 67.5 |
| 3266 | 67.5 |
| 3267 | 70.5 |
| 3268 | 70.5 |
| 3269 | 73.5 |
| 3270 | 73.5 |
| 3271 | 73.5 |
| 3272 | 73.5 |
| 3273 | 73.5 |
| 3274 | 73.5 |
| 3275 | 73.5 |
| 3276 | 73.5 |
| 3277 | 73.5 |
| 3278 | 73.5 |
| 3279 | 75 |
| 3280 | 75 |
| 3281 | 75 |
| 3282 | 75 |
| 3283 | 75 |
| 3284 | 75 |
| 3285 | 73.5 |
| 3286 | 73.5 |
| 3287 | 72.75 |
| 3288 | 67.5 |
| 3289 | 67.5 |
| 3290 | 67.5 |
| 3291 | 70.5 |
| 3292 | 70.5 |
| 3293 | 73.5 |
| 3294 | 73.5 |
| 3295 | 73.5 |
| 3296 | 73.5 |
| 3297 | 73.5 |
| 3298 | 73.5 |
| 3299 | 73.5 |
| 3300 | 73.5 |
| 3301 | 73.5 |
| 3302 | 73.5 |
| 3303 | 75 |
| 3304 | 75 |
| 3305 | 75 |
| 3306 | 75 |
| 3307 | 75 |
| 3308 | 75 |
| 3309 | 73.5 |
| 3310 | 73.5 |
| 3311 | 72.75 |
| 3312 | 67.5 |
| 3313 | 67.5 |
| 3314 | 67.5 |
| 3315 | 67.5 |
| 3316 | 67.5 |
| 3317 | 71.25 |
| 3318 | 71.25 |
| 3319 | 73.5 |
| 3320 | 73.5 |
| 3321 | 73.5 |
| 3322 | 73.5 |
| 3323 | 74.25 |
| 3324 | 74.25 |
| 3325 | 75 |
| 3326 | 75 |
| 3327 | 75 |
| 3328 | 75 |
| 3329 | 75 |
| 3330 | 75 |
| 3331 | 75 |
| 3332 | 75 |
| 3333 | 75 |
| 3334 | 73.5 |
| 3335 | 73.5 |
| 3336 | 67.5 |
| 3337 | 67.5 |
| 3338 | 67.5 |
| 3339 | 67.5 |
| 3340 | 67.5 |
| 3341 | 71.25 |
| 3342 | 71.25 |
| 3343 | 73.5 |
| 3344 | 73.5 |
| 3345 | 73.5 |
| 3346 | 73.5 |
| 3347 | 74.25 |
| 3348 | 74.25 |
| 3349 | 75 |
| 3350 | 75 |
| 3351 | 75 |
| 3352 | 75 |
| 3353 | 75 |
| 3354 | 75 |
| 3355 | 75 |
| 3356 | 75 |
| 3357 | 75 |
| 3358 | 73.5 |
| 3359 | 73.5 |
| 3360 | 67.5 |
| 3361 | 67.5 |
| 3362 | 67.5 |
| 3363 | 70.5 |
| 3364 | 70.5 |
| 3365 | 73.5 |
| 3366 | 73.5 |
| 3367 | 73.5 |
| 3368 | 73.5 |
| 3369 | 73.5 |
| 3370 | 73.5 |
| 3371 | 73.5 |
| 3372 | 73.5 |
| 3373 | 73.5 |
| 3374 | 73.5 |
| 3375 | 75 |
| 3376 | 75 |
| 3377 | 75 |
| 3378 | 75 |
| 3379 | 75 |
| 3380 | 75 |
| 3381 | 73.5 |
| 3382 | 73.5 |
| 3383 | 72.75 |
| 3384 | 67.5 |
| 3385 | 67.5 |
| 3386 | 67.5 |
| 3387 | 70.5 |
| 3388 | 70.5 |
| 3389 | 73.5 |
| 3390 | 73.5 |
| 3391 | 73.5 |
| 3392 | 73.5 |
| 3393 | 73.5 |
| 3394 | 73.5 |
| 3395 | 73.5 |
| 3396 | 73.5 |
| 3397 | 73.5 |
| 3398 | 73.5 |
| 3399 | 75 |
| 3400 | 75 |
| 3401 | 75 |
| 3402 | 75 |
| 3403 | 75 |
| 3404 | 75 |
| 3405 | 73.5 |
| 3406 | 73.5 |
| 3407 | 72.75 |
| 3408 | 67.5 |
| 3409 | 67.5 |
| 3410 | 67.5 |
| 3411 | 70.5 |
| 3412 | 70.5 |
| 3413 | 73.5 |
| 3414 | 73.5 |
| 3415 | 73.5 |
| 3416 | 73.5 |
| 3417 | 73.5 |
| 3418 | 73.5 |
| 3419 | 73.5 |
| 3420 | 73.5 |
| 3421 | 73.5 |
| 3422 | 73.5 |
| 3423 | 75 |
| 3424 | 75 |
| 3425 | 75 |
| 3426 | 75 |
| 3427 | 75 |
| 3428 | 75 |
| 3429 | 73.5 |
| 3430 | 73.5 |
| 3431 | 72.75 |
| 3432 | 67.5 |
| 3433 | 67.5 |
| 3434 | 67.5 |
| 3435 | 70.5 |
| 3436 | 70.5 |
| 3437 | 73.5 |
| 3438 | 73.5 |
| 3439 | 73.5 |
| 3440 | 73.5 |
| 3441 | 73.5 |
| 3442 | 73.5 |
| 3443 | 73.5 |
| 3444 | 73.5 |
| 3445 | 73.5 |
| 3446 | 73.5 |
| 3447 | 75 |
| 3448 | 75 |
| 3449 | 75 |
| 3450 | 75 |
| 3451 | 75 |
| 3452 | 75 |
| 3453 | 73.5 |
| 3454 | 73.5 |
| 3455 | 72.75 |
| 3456 | 67.5 |
| 3457 | 67.5 |
| 3458 | 67.5 |
| 3459 | 70.5 |
| 3460 | 70.5 |
| 3461 | 73.5 |
| 3462 | 73.5 |
| 3463 | 73.5 |
| 3464 | 73.5 |
| 3465 | 73.5 |
| 3466 | 73.5 |
| 3467 | 73.5 |
| 3468 | 73.5 |
| 3469 | 73.5 |
| 3470 | 73.5 |
| 3471 | 75 |
| 3472 | 75 |
| 3473 | 75 |
| 3474 | 75 |
| 3475 | 75 |
| 3476 | 75 |
| 3477 | 73.5 |
| 3478 | 73.5 |
| 3479 | 72.75 |
| 3480 | 67.5 |
| 3481 | 67.5 |
| 3482 | 67.5 |
| 3483 | 67.5 |
| 3484 | 67.5 |
| 3485 | 71.25 |
| 3486 | 71.25 |
| 3487 | 73.5 |
| 3488 | 73.5 |
| 3489 | 73.5 |
| 3490 | 73.5 |
| 3491 | 74.25 |
| 3492 | 74.25 |
| 3493 | 75 |
| 3494 | 75 |
| 3495 | 75 |
| 3496 | 75 |
| 3497 | 75 |
| 3498 | 75 |
| 3499 | 75 |
| 3500 | 75 |
| 3501 | 75 |
| 3502 | 73.5 |
| 3503 | 73.5 |
| 3504 | 67.5 |
| 3505 | 67.5 |
| 3506 | 67.5 |
| 3507 | 67.5 |
| 3508 | 67.5 |
| 3509 | 71.25 |
| 3510 | 71.25 |
| 3511 | 73.5 |
| 3512 | 73.5 |
| 3513 | 73.5 |
| 3514 | 73.5 |
| 3515 | 74.25 |
| 3516 | 74.25 |
| 3517 | 75 |
| 3518 | 75 |
| 3519 | 75 |
| 3520 | 75 |
| 3521 | 75 |
| 3522 | 75 |
| 3523 | 75 |
| 3524 | 75 |
| 3525 | 75 |
| 3526 | 73.5 |
| 3527 | 73.5 |
| 3528 | 67.5 |
| 3529 | 67.5 |
| 3530 | 67.5 |
| 3531 | 70.5 |
| 3532 | 70.5 |
| 3533 | 73.5 |
| 3534 | 73.5 |
| 3535 | 73.5 |
| 3536 | 73.5 |
| 3537 | 73.5 |
| 3538 | 73.5 |
| 3539 | 73.5 |
| 3540 | 73.5 |
| 3541 | 73.5 |
| 3542 | 73.5 |
| 3543 | 75 |
| 3544 | 75 |
| 3545 | 75 |
| 3546 | 75 |
| 3547 | 75 |
| 3548 | 75 |
| 3549 | 73.5 |
| 3550 | 73.5 |
| 3551 | 72.75 |
| 3552 | 67.5 |
| 3553 | 67.5 |
| 3554 | 67.5 |
| 3555 | 70.5 |
| 3556 | 70.5 |
| 3557 | 73.5 |
| 3558 | 73.5 |
| 3559 | 73.5 |
| 3560 | 73.5 |
| 3561 | 73.5 |
| 3562 | 73.5 |
| 3563 | 73.5 |
| 3564 | 73.5 |
| 3565 | 73.5 |
| 3566 | 73.5 |
| 3567 | 75 |
| 3568 | 75 |
| 3569 | 75 |
| 3570 | 75 |
| 3571 | 75 |
| 3572 | 75 |
| 3573 | 73.5 |
| 3574 | 73.5 |
| 3575 | 72.75 |
| 3576 | 67.5 |
| 3577 | 67.5 |
| 3578 | 67.5 |
| 3579 | 70.5 |
| 3580 | 70.5 |
| 3581 | 73.5 |
| 3582 | 73.5 |
| 3583 | 73.5 |
| 3584 | 73.5 |
| 3585 | 73.5 |
| 3586 | 73.5 |
| 3587 | 73.5 |
| 3588 | 73.5 |
| 3589 | 73.5 |
| 3590 | 73.5 |
| 3591 | 75 |
| 3592 | 75 |
| 3593 | 75 |
| 3594 | 75 |
| 3595 | 75 |
| 3596 | 75 |
| 3597 | 73.5 |
| 3598 | 73.5 |
| 3599 | 72.75 |
| 3600 | 67.5 |
| 3601 | 67.5 |
| 3602 | 67.5 |
| 3603 | 70.5 |
| 3604 | 70.5 |
| 3605 | 73.5 |
| 3606 | 73.5 |
| 3607 | 73.5 |
| 3608 | 73.5 |
| 3609 | 73.5 |
| 3610 | 73.5 |
| 3611 | 73.5 |
| 3612 | 73.5 |
| 3613 | 73.5 |
| 3614 | 73.5 |
| 3615 | 75 |
| 3616 | 75 |
| 3617 | 75 |
| 3618 | 75 |
| 3619 | 75 |
| 3620 | 75 |
| 3621 | 73.5 |
| 3622 | 73.5 |
| 3623 | 72.75 |
| 3624 | 67.5 |
| 3625 | 67.5 |
| 3626 | 67.5 |
| 3627 | 70.5 |
| 3628 | 70.5 |
| 3629 | 73.5 |
| 3630 | 73.5 |
| 3631 | 73.5 |
| 3632 | 73.5 |
| 3633 | 73.5 |
| 3634 | 73.5 |
| 3635 | 73.5 |
| 3636 | 73.5 |
| 3637 | 73.5 |
| 3638 | 73.5 |
| 3639 | 75 |
| 3640 | 75 |
| 3641 | 75 |
| 3642 | 75 |
| 3643 | 75 |
| 3644 | 75 |
| 3645 | 73.5 |
| 3646 | 73.5 |
| 3647 | 72.75 |
| 3648 | 67.5 |
| 3649 | 67.5 |
| 3650 | 73.5 |
| 3651 | 73.5 |
| 3652 | 73.5 |
| 3653 | 73.5 |
| 3654 | 73.5 |
| 3655 | 75 |
| 3656 | 75 |
| 3657 | 75 |
| 3658 | 75 |
| 3659 | 75 |
| 3660 | 75 |
| 3661 | 75 |
| 3662 | 75 |
| 3663 | 75 |
| 3664 | 75 |
| 3665 | 75 |
| 3666 | 75 |
| 3667 | 75 |
| 3668 | 75 |
| 3669 | 75 |
| 3670 | 67.5 |
| 3671 | 67.5 |
| 3672 | 67.5 |
| 3673 | 67.5 |
| 3674 | 73.5 |
| 3675 | 73.5 |
| 3676 | 73.5 |
| 3677 | 73.5 |
| 3678 | 73.5 |
| 3679 | 75 |
| 3680 | 75 |
| 3681 | 75 |
| 3682 | 75 |
| 3683 | 75 |
| 3684 | 75 |
| 3685 | 75 |
| 3686 | 75 |
| 3687 | 75 |
| 3688 | 75 |
| 3689 | 75 |
| 3690 | 75 |
| 3691 | 75 |
| 3692 | 75 |
| 3693 | 75 |
| 3694 | 67.5 |
| 3695 | 67.5 |
| 3696 | 67.5 |
| 3697 | 67.5 |
| 3698 | 73.5 |
| 3699 | 73.5 |
| 3700 | 73.5 |
| 3701 | 75 |
| 3702 | 75 |
| 3703 | 75 |
| 3704 | 75 |
| 3705 | 75 |
| 3706 | 75 |
| 3707 | 75 |
| 3708 | 75 |
| 3709 | 75 |
| 3710 | 75 |
| 3711 | 75 |
| 3712 | 75 |
| 3713 | 75 |
| 3714 | 75 |
| 3715 | 75 |
| 3716 | 75 |
| 3717 | 67.5 |
| 3718 | 67.5 |
| 3719 | 67.5 |
| 3720 | 67.5 |
| 3721 | 67.5 |
| 3722 | 73.5 |
| 3723 | 73.5 |
| 3724 | 73.5 |
| 3725 | 75 |
| 3726 | 75 |
| 3727 | 75 |
| 3728 | 75 |
| 3729 | 75 |
| 3730 | 75 |
| 3731 | 75 |
| 3732 | 75 |
| 3733 | 75 |
| 3734 | 75 |
| 3735 | 75 |
| 3736 | 75 |
| 3737 | 75 |
| 3738 | 75 |
| 3739 | 75 |
| 3740 | 75 |
| 3741 | 67.5 |
| 3742 | 67.5 |
| 3743 | 67.5 |
| 3744 | 67.5 |
| 3745 | 67.5 |
| 3746 | 73.5 |
| 3747 | 73.5 |
| 3748 | 73.5 |
| 3749 | 75 |
| 3750 | 75 |
| 3751 | 75 |
| 3752 | 75 |
| 3753 | 75 |
| 3754 | 75 |
| 3755 | 75 |
| 3756 | 75 |
| 3757 | 75 |
| 3758 | 75 |
| 3759 | 75 |
| 3760 | 75 |
| 3761 | 75 |
| 3762 | 75 |
| 3763 | 75 |
| 3764 | 75 |
| 3765 | 67.5 |
| 3766 | 67.5 |
| 3767 | 67.5 |
| 3768 | 67.5 |
| 3769 | 67.5 |
| 3770 | 73.5 |
| 3771 | 73.5 |
| 3772 | 73.5 |
| 3773 | 75 |
| 3774 | 75 |
| 3775 | 75 |
| 3776 | 75 |
| 3777 | 75 |
| 3778 | 75 |
| 3779 | 75 |
| 3780 | 75 |
| 3781 | 75 |
| 3782 | 75 |
| 3783 | 75 |
| 3784 | 75 |
| 3785 | 75 |
| 3786 | 75 |
| 3787 | 75 |
| 3788 | 75 |
| 3789 | 67.5 |
| 3790 | 67.5 |
| 3791 | 67.5 |
| 3792 | 67.5 |
| 3793 | 67.5 |
| 3794 | 73.5 |
| 3795 | 73.5 |
| 3796 | 73.5 |
| 3797 | 75 |
| 3798 | 75 |
| 3799 | 75 |
| 3800 | 75 |
| 3801 | 75 |
| 3802 | 75 |
| 3803 | 75 |
| 3804 | 75 |
| 3805 | 75 |
| 3806 | 75 |
| 3807 | 75 |
| 3808 | 75 |
| 3809 | 75 |
| 3810 | 75 |
| 3811 | 75 |
| 3812 | 75 |
| 3813 | 67.5 |
| 3814 | 67.5 |
| 3815 | 67.5 |
| 3816 | 67.5 |
| 3817 | 67.5 |
| 3818 | 73.5 |
| 3819 | 73.5 |
| 3820 | 73.5 |
| 3821 | 73.5 |
| 3822 | 73.5 |
| 3823 | 75 |
| 3824 | 75 |
| 3825 | 75 |
| 3826 | 75 |
| 3827 | 75 |
| 3828 | 75 |
| 3829 | 75 |
| 3830 | 75 |
| 3831 | 75 |
| 3832 | 75 |
| 3833 | 75 |
| 3834 | 75 |
| 3835 | 75 |
| 3836 | 75 |
| 3837 | 75 |
| 3838 | 67.5 |
| 3839 | 67.5 |
| 3840 | 67.5 |
| 3841 | 67.5 |
| 3842 | 73.5 |
| 3843 | 73.5 |
| 3844 | 73.5 |
| 3845 | 73.5 |
| 3846 | 73.5 |
| 3847 | 75 |
| 3848 | 75 |
| 3849 | 75 |
| 3850 | 75 |
| 3851 | 75 |
| 3852 | 75 |
| 3853 | 75 |
| 3854 | 75 |
| 3855 | 75 |
| 3856 | 75 |
| 3857 | 75 |
| 3858 | 75 |
| 3859 | 75 |
| 3860 | 75 |
| 3861 | 75 |
| 3862 | 67.5 |
| 3863 | 67.5 |
| 3864 | 67.5 |
| 3865 | 67.5 |
| 3866 | 73.5 |
| 3867 | 73.5 |
| 3868 | 73.5 |
| 3869 | 75 |
| 3870 | 75 |
| 3871 | 75 |
| 3872 | 75 |
| 3873 | 75 |
| 3874 | 75 |
| 3875 | 75 |
| 3876 | 75 |
| 3877 | 75 |
| 3878 | 75 |
| 3879 | 75 |
| 3880 | 75 |
| 3881 | 75 |
| 3882 | 75 |
| 3883 | 75 |
| 3884 | 75 |
| 3885 | 67.5 |
| 3886 | 67.5 |
| 3887 | 67.5 |
| 3888 | 67.5 |
| 3889 | 67.5 |
| 3890 | 73.5 |
| 3891 | 73.5 |
| 3892 | 73.5 |
| 3893 | 75 |
| 3894 | 75 |
| 3895 | 75 |
| 3896 | 75 |
| 3897 | 75 |
| 3898 | 75 |
| 3899 | 75 |
| 3900 | 75 |
| 3901 | 75 |
| 3902 | 75 |
| 3903 | 75 |
| 3904 | 75 |
| 3905 | 75 |
| 3906 | 75 |
| 3907 | 75 |
| 3908 | 75 |
| 3909 | 67.5 |
| 3910 | 67.5 |
| 3911 | 67.5 |
| 3912 | 67.5 |
| 3913 | 67.5 |
| 3914 | 73.5 |
| 3915 | 73.5 |
| 3916 | 73.5 |
| 3917 | 75 |
| 3918 | 75 |
| 3919 | 75 |
| 3920 | 75 |
| 3921 | 75 |
| 3922 | 75 |
| 3923 | 75 |
| 3924 | 75 |
| 3925 | 75 |
| 3926 | 75 |
| 3927 | 75 |
| 3928 | 75 |
| 3929 | 75 |
| 3930 | 75 |
| 3931 | 75 |
| 3932 | 75 |
| 3933 | 67.5 |
| 3934 | 67.5 |
| 3935 | 67.5 |
| 3936 | 67.5 |
| 3937 | 67.5 |
| 3938 | 73.5 |
| 3939 | 73.5 |
| 3940 | 73.5 |
| 3941 | 75 |
| 3942 | 75 |
| 3943 | 75 |
| 3944 | 75 |
| 3945 | 75 |
| 3946 | 75 |
| 3947 | 75 |
| 3948 | 75 |
| 3949 | 75 |
| 3950 | 75 |
| 3951 | 75 |
| 3952 | 75 |
| 3953 | 75 |
| 3954 | 75 |
| 3955 | 75 |
| 3956 | 75 |
| 3957 | 67.5 |
| 3958 | 67.5 |
| 3959 | 67.5 |
| 3960 | 67.5 |
| 3961 | 67.5 |
| 3962 | 73.5 |
| 3963 | 73.5 |
| 3964 | 73.5 |
| 3965 | 75 |
| 3966 | 75 |
| 3967 | 75 |
| 3968 | 75 |
| 3969 | 75 |
| 3970 | 75 |
| 3971 | 75 |
| 3972 | 75 |
| 3973 | 75 |
| 3974 | 75 |
| 3975 | 75 |
| 3976 | 75 |
| 3977 | 75 |
| 3978 | 75 |
| 3979 | 75 |
| 3980 | 75 |
| 3981 | 67.5 |
| 3982 | 67.5 |
| 3983 | 67.5 |
| 3984 | 67.5 |
| 3985 | 67.5 |
| 3986 | 73.5 |
| 3987 | 73.5 |
| 3988 | 73.5 |
| 3989 | 73.5 |
| 3990 | 73.5 |
| 3991 | 75 |
| 3992 | 75 |
| 3993 | 75 |
| 3994 | 75 |
| 3995 | 75 |
| 3996 | 75 |
| 3997 | 75 |
| 3998 | 75 |
| 3999 | 75 |
| 4000 | 75 |
| 4001 | 75 |
| 4002 | 75 |
| 4003 | 75 |
| 4004 | 75 |
| 4005 | 75 |
| 4006 | 67.5 |
| 4007 | 67.5 |
| 4008 | 67.5 |
| 4009 | 67.5 |
| 4010 | 73.5 |
| 4011 | 73.5 |
| 4012 | 73.5 |
| 4013 | 73.5 |
| 4014 | 73.5 |
| 4015 | 75 |
| 4016 | 75 |
| 4017 | 75 |
| 4018 | 75 |
| 4019 | 75 |
| 4020 | 75 |
| 4021 | 75 |
| 4022 | 75 |
| 4023 | 75 |
| 4024 | 75 |
| 4025 | 75 |
| 4026 | 75 |
| 4027 | 75 |
| 4028 | 75 |
| 4029 | 75 |
| 4030 | 67.5 |
| 4031 | 67.5 |
| 4032 | 67.5 |
| 4033 | 67.5 |
| 4034 | 73.5 |
| 4035 | 73.5 |
| 4036 | 73.5 |
| 4037 | 75 |
| 4038 | 75 |
| 4039 | 75 |
| 4040 | 75 |
| 4041 | 75 |
| 4042 | 75 |
| 4043 | 75 |
| 4044 | 75 |
| 4045 | 75 |
| 4046 | 75 |
| 4047 | 75 |
| 4048 | 75 |
| 4049 | 75 |
| 4050 | 75 |
| 4051 | 75 |
| 4052 | 75 |
| 4053 | 67.5 |
| 4054 | 67.5 |
| 4055 | 67.5 |
| 4056 | 67.5 |
| 4057 | 67.5 |
| 4058 | 73.5 |
| 4059 | 73.5 |
| 4060 | 73.5 |
| 4061 | 75 |
| 4062 | 75 |
| 4063 | 75 |
| 4064 | 75 |
| 4065 | 75 |
| 4066 | 75 |
| 4067 | 75 |
| 4068 | 75 |
| 4069 | 75 |
| 4070 | 75 |
| 4071 | 75 |
| 4072 | 75 |
| 4073 | 75 |
| 4074 | 75 |
| 4075 | 75 |
| 4076 | 75 |
| 4077 | 67.5 |
| 4078 | 67.5 |
| 4079 | 67.5 |
| 4080 | 67.5 |
| 4081 | 67.5 |
| 4082 | 73.5 |
| 4083 | 73.5 |
| 4084 | 73.5 |
| 4085 | 75 |
| 4086 | 75 |
| 4087 | 75 |
| 4088 | 75 |
| 4089 | 75 |
| 4090 | 75 |
| 4091 | 75 |
| 4092 | 75 |
| 4093 | 75 |
| 4094 | 75 |
| 4095 | 75 |
| 4096 | 75 |
| 4097 | 75 |
| 4098 | 75 |
| 4099 | 75 |
| 4100 | 75 |
| 4101 | 67.5 |
| 4102 | 67.5 |
| 4103 | 67.5 |
| 4104 | 67.5 |
| 4105 | 67.5 |
| 4106 | 73.5 |
| 4107 | 73.5 |
| 4108 | 73.5 |
| 4109 | 75 |
| 4110 | 75 |
| 4111 | 75 |
| 4112 | 75 |
| 4113 | 75 |
| 4114 | 75 |
| 4115 | 75 |
| 4116 | 75 |
| 4117 | 75 |
| 4118 | 75 |
| 4119 | 75 |
| 4120 | 75 |
| 4121 | 75 |
| 4122 | 75 |
| 4123 | 75 |
| 4124 | 75 |
| 4125 | 67.5 |
| 4126 | 67.5 |
| 4127 | 67.5 |
| 4128 | 67.5 |
| 4129 | 67.5 |
| 4130 | 73.5 |
| 4131 | 73.5 |
| 4132 | 73.5 |
| 4133 | 75 |
| 4134 | 75 |
| 4135 | 75 |
| 4136 | 75 |
| 4137 | 75 |
| 4138 | 75 |
| 4139 | 75 |
| 4140 | 75 |
| 4141 | 75 |
| 4142 | 75 |
| 4143 | 75 |
| 4144 | 75 |
| 4145 | 75 |
| 4146 | 75 |
| 4147 | 75 |
| 4148 | 75 |
| 4149 | 67.5 |
| 4150 | 67.5 |
| 4151 | 67.5 |
| 4152 | 67.5 |
| 4153 | 67.5 |
| 4154 | 73.5 |
| 4155 | 73.5 |
| 4156 | 73.5 |
| 4157 | 73.5 |
| 4158 | 73.5 |
| 4159 | 75 |
| 4160 | 75 |
| 4161 | 75 |
| 4162 | 75 |
| 4163 | 75 |
| 4164 | 75 |
| 4165 | 75 |
| 4166 | 75 |
| 4167 | 75 |
| 4168 | 75 |
| 4169 | 75 |
| 4170 | 75 |
| 4171 | 75 |
| 4172 | 75 |
| 4173 | 75 |
| 4174 | 67.5 |
| 4175 | 67.5 |
| 4176 | 67.5 |
| 4177 | 67.5 |
| 4178 | 73.5 |
| 4179 | 73.5 |
| 4180 | 73.5 |
| 4181 | 73.5 |
| 4182 | 73.5 |
| 4183 | 75 |
| 4184 | 75 |
| 4185 | 75 |
| 4186 | 75 |
| 4187 | 75 |
| 4188 | 75 |
| 4189 | 75 |
| 4190 | 75 |
| 4191 | 75 |
| 4192 | 75 |
| 4193 | 75 |
| 4194 | 75 |
| 4195 | 75 |
| 4196 | 75 |
| 4197 | 75 |
| 4198 | 67.5 |
| 4199 | 67.5 |
| 4200 | 67.5 |
| 4201 | 67.5 |
| 4202 | 73.5 |
| 4203 | 73.5 |
| 4204 | 73.5 |
| 4205 | 75 |
| 4206 | 75 |
| 4207 | 75 |
| 4208 | 75 |
| 4209 | 75 |
| 4210 | 75 |
| 4211 | 75 |
| 4212 | 75 |
| 4213 | 75 |
| 4214 | 75 |
| 4215 | 75 |
| 4216 | 75 |
| 4217 | 75 |
| 4218 | 75 |
| 4219 | 75 |
| 4220 | 75 |
| 4221 | 67.5 |
| 4222 | 67.5 |
| 4223 | 67.5 |
| 4224 | 67.5 |
| 4225 | 67.5 |
| 4226 | 73.5 |
| 4227 | 73.5 |
| 4228 | 73.5 |
| 4229 | 75 |
| 4230 | 75 |
| 4231 | 75 |
| 4232 | 75 |
| 4233 | 75 |
| 4234 | 75 |
| 4235 | 75 |
| 4236 | 75 |
| 4237 | 75 |
| 4238 | 75 |
| 4239 | 75 |
| 4240 | 75 |
| 4241 | 75 |
| 4242 | 75 |
| 4243 | 75 |
| 4244 | 75 |
| 4245 | 67.5 |
| 4246 | 67.5 |
| 4247 | 67.5 |
| 4248 | 67.5 |
| 4249 | 67.5 |
| 4250 | 73.5 |
| 4251 | 73.5 |
| 4252 | 73.5 |
| 4253 | 75 |
| 4254 | 75 |
| 4255 | 75 |
| 4256 | 75 |
| 4257 | 75 |
| 4258 | 75 |
| 4259 | 75 |
| 4260 | 75 |
| 4261 | 75 |
| 4262 | 75 |
| 4263 | 75 |
| 4264 | 75 |
| 4265 | 75 |
| 4266 | 75 |
| 4267 | 75 |
| 4268 | 75 |
| 4269 | 67.5 |
| 4270 | 67.5 |
| 4271 | 67.5 |
| 4272 | 67.5 |
| 4273 | 67.5 |
| 4274 | 73.5 |
| 4275 | 73.5 |
| 4276 | 73.5 |
| 4277 | 75 |
| 4278 | 75 |
| 4279 | 75 |
| 4280 | 75 |
| 4281 | 75 |
| 4282 | 75 |
| 4283 | 75 |
| 4284 | 75 |
| 4285 | 75 |
| 4286 | 75 |
| 4287 | 75 |
| 4288 | 75 |
| 4289 | 75 |
| 4290 | 75 |
| 4291 | 75 |
| 4292 | 75 |
| 4293 | 67.5 |
| 4294 | 67.5 |
| 4295 | 67.5 |
| 4296 | 67.5 |
| 4297 | 67.5 |
| 4298 | 73.5 |
| 4299 | 73.5 |
| 4300 | 73.5 |
| 4301 | 75 |
| 4302 | 75 |
| 4303 | 75 |
| 4304 | 75 |
| 4305 | 75 |
| 4306 | 75 |
| 4307 | 75 |
| 4308 | 75 |
| 4309 | 75 |
| 4310 | 75 |
| 4311 | 75 |
| 4312 | 75 |
| 4313 | 75 |
| 4314 | 75 |
| 4315 | 75 |
| 4316 | 75 |
| 4317 | 67.5 |
| 4318 | 67.5 |
| 4319 | 67.5 |
| 4320 | 67.5 |
| 4321 | 67.5 |
| 4322 | 73.5 |
| 4323 | 73.5 |
| 4324 | 73.5 |
| 4325 | 73.5 |
| 4326 | 73.5 |
| 4327 | 75 |
| 4328 | 75 |
| 4329 | 75 |
| 4330 | 75 |
| 4331 | 75 |
| 4332 | 75 |
| 4333 | 75 |
| 4334 | 75 |
| 4335 | 75 |
| 4336 | 75 |
| 4337 | 75 |
| 4338 | 75 |
| 4339 | 75 |
| 4340 | 75 |
| 4341 | 75 |
| 4342 | 67.5 |
| 4343 | 67.5 |
| 4344 | 67.5 |
| 4345 | 67.5 |
| 4346 | 73.5 |
| 4347 | 73.5 |
| 4348 | 73.5 |
| 4349 | 73.5 |
| 4350 | 73.5 |
| 4351 | 75 |
| 4352 | 75 |
| 4353 | 75 |
| 4354 | 75 |
| 4355 | 75 |
| 4356 | 75 |
| 4357 | 75 |
| 4358 | 75 |
| 4359 | 75 |
| 4360 | 75 |
| 4361 | 75 |
| 4362 | 75 |
| 4363 | 75 |
| 4364 | 75 |
| 4365 | 75 |
| 4366 | 67.5 |
| 4367 | 67.5 |
| 4368 | 90 |
| 4369 | 90 |
| 4370 | 98 |
| 4371 | 98 |
| 4372 | 98 |
| 4373 | 100 |
| 4374 | 100 |
| 4375 | 100 |
| 4376 | 100 |
| 4377 | 100 |
| 4378 | 100 |
| 4379 | 100 |
| 4380 | 100 |
| 4381 | 100 |
| 4382 | 100 |
| 4383 | 100 |
| 4384 | 100 |
| 4385 | 100 |
| 4386 | 100 |
| 4387 | 100 |
| 4388 | 100 |
| 4389 | 90 |
| 4390 | 90 |
| 4391 | 90 |
| 4392 | 90 |
| 4393 | 90 |
| 4394 | 98 |
| 4395 | 98 |
| 4396 | 98 |
| 4397 | 100 |
| 4398 | 100 |
| 4399 | 100 |
| 4400 | 100 |
| 4401 | 100 |
| 4402 | 100 |
| 4403 | 100 |
| 4404 | 100 |
| 4405 | 100 |
| 4406 | 100 |
| 4407 | 100 |
| 4408 | 100 |
| 4409 | 100 |
| 4410 | 100 |
| 4411 | 100 |
| 4412 | 100 |
| 4413 | 90 |
| 4414 | 90 |
| 4415 | 90 |
| 4416 | 90 |
| 4417 | 90 |
| 4418 | 98 |
| 4419 | 98 |
| 4420 | 98 |
| 4421 | 100 |
| 4422 | 100 |
| 4423 | 100 |
| 4424 | 100 |
| 4425 | 100 |
| 4426 | 100 |
| 4427 | 100 |
| 4428 | 100 |
| 4429 | 100 |
| 4430 | 100 |
| 4431 | 100 |
| 4432 | 100 |
| 4433 | 100 |
| 4434 | 100 |
| 4435 | 100 |
| 4436 | 100 |
| 4437 | 90 |
| 4438 | 90 |
| 4439 | 90 |
| 4440 | 90 |
| 4441 | 90 |
| 4442 | 98 |
| 4443 | 98 |
| 4444 | 98 |
| 4445 | 100 |
| 4446 | 100 |
| 4447 | 100 |
| 4448 | 100 |
| 4449 | 100 |
| 4450 | 100 |
| 4451 | 100 |
| 4452 | 100 |
| 4453 | 100 |
| 4454 | 100 |
| 4455 | 100 |
| 4456 | 100 |
| 4457 | 100 |
| 4458 | 100 |
| 4459 | 100 |
| 4460 | 100 |
| 4461 | 90 |
| 4462 | 90 |
| 4463 | 90 |
| 4464 | 90 |
| 4465 | 90 |
| 4466 | 98 |
| 4467 | 98 |
| 4468 | 98 |
| 4469 | 100 |
| 4470 | 100 |
| 4471 | 100 |
| 4472 | 100 |
| 4473 | 100 |
| 4474 | 100 |
| 4475 | 100 |
| 4476 | 100 |
| 4477 | 100 |
| 4478 | 100 |
| 4479 | 100 |
| 4480 | 100 |
| 4481 | 100 |
| 4482 | 100 |
| 4483 | 100 |
| 4484 | 100 |
| 4485 | 90 |
| 4486 | 90 |
| 4487 | 90 |
| 4488 | 90 |
| 4489 | 90 |
| 4490 | 98 |
| 4491 | 98 |
| 4492 | 98 |
| 4493 | 98 |
| 4494 | 98 |
| 4495 | 100 |
| 4496 | 100 |
| 4497 | 100 |
| 4498 | 100 |
| 4499 | 100 |
| 4500 | 100 |
| 4501 | 100 |
| 4502 | 100 |
| 4503 | 100 |
| 4504 | 100 |
| 4505 | 100 |
| 4506 | 100 |
| 4507 | 100 |
| 4508 | 100 |
| 4509 | 100 |
| 4510 | 90 |
| 4511 | 90 |
| 4512 | 90 |
| 4513 | 90 |
| 4514 | 98 |
| 4515 | 98 |
| 4516 | 98 |
| 4517 | 98 |
| 4518 | 98 |
| 4519 | 100 |
| 4520 | 100 |
| 4521 | 100 |
| 4522 | 100 |
| 4523 | 100 |
| 4524 | 100 |
| 4525 | 100 |
| 4526 | 100 |
| 4527 | 100 |
| 4528 | 100 |
| 4529 | 100 |
| 4530 | 100 |
| 4531 | 100 |
| 4532 | 100 |
| 4533 | 100 |
| 4534 | 90 |
| 4535 | 90 |
| 4536 | 90 |
| 4537 | 90 |
| 4538 | 98 |
| 4539 | 98 |
| 4540 | 98 |
| 4541 | 100 |
| 4542 | 100 |
| 4543 | 100 |
| 4544 | 100 |
| 4545 | 100 |
| 4546 | 100 |
| 4547 | 100 |
| 4548 | 100 |
| 4549 | 100 |
| 4550 | 100 |
| 4551 | 100 |
| 4552 | 100 |
| 4553 | 100 |
| 4554 | 100 |
| 4555 | 100 |
| 4556 | 100 |
| 4557 | 90 |
| 4558 | 90 |
| 4559 | 90 |
| 4560 | 90 |
| 4561 | 90 |
| 4562 | 98 |
| 4563 | 98 |
| 4564 | 98 |
| 4565 | 100 |
| 4566 | 100 |
| 4567 | 100 |
| 4568 | 100 |
| 4569 | 100 |
| 4570 | 100 |
| 4571 | 100 |
| 4572 | 100 |
| 4573 | 100 |
| 4574 | 100 |
| 4575 | 100 |
| 4576 | 100 |
| 4577 | 100 |
| 4578 | 100 |
| 4579 | 100 |
| 4580 | 100 |
| 4581 | 90 |
| 4582 | 90 |
| 4583 | 90 |
| 4584 | 90 |
| 4585 | 90 |
| 4586 | 98 |
| 4587 | 98 |
| 4588 | 98 |
| 4589 | 100 |
| 4590 | 100 |
| 4591 | 100 |
| 4592 | 100 |
| 4593 | 100 |
| 4594 | 100 |
| 4595 | 100 |
| 4596 | 100 |
| 4597 | 100 |
| 4598 | 100 |
| 4599 | 100 |
| 4600 | 100 |
| 4601 | 100 |
| 4602 | 100 |
| 4603 | 100 |
| 4604 | 100 |
| 4605 | 90 |
| 4606 | 90 |
| 4607 | 90 |
| 4608 | 90 |
| 4609 | 90 |
| 4610 | 98 |
| 4611 | 98 |
| 4612 | 98 |
| 4613 | 100 |
| 4614 | 100 |
| 4615 | 100 |
| 4616 | 100 |
| 4617 | 100 |
| 4618 | 100 |
| 4619 | 100 |
| 4620 | 100 |
| 4621 | 100 |
| 4622 | 100 |
| 4623 | 100 |
| 4624 | 100 |
| 4625 | 100 |
| 4626 | 100 |
| 4627 | 100 |
| 4628 | 100 |
| 4629 | 90 |
| 4630 | 90 |
| 4631 | 90 |
| 4632 | 90 |
| 4633 | 90 |
| 4634 | 98 |
| 4635 | 98 |
| 4636 | 98 |
| 4637 | 100 |
| 4638 | 100 |
| 4639 | 100 |
| 4640 | 100 |
| 4641 | 100 |
| 4642 | 100 |
| 4643 | 100 |
| 4644 | 100 |
| 4645 | 100 |
| 4646 | 100 |
| 4647 | 100 |
| 4648 | 100 |
| 4649 | 100 |
| 4650 | 100 |
| 4651 | 100 |
| 4652 | 100 |
| 4653 | 90 |
| 4654 | 90 |
| 4655 | 90 |
| 4656 | 90 |
| 4657 | 90 |
| 4658 | 98 |
| 4659 | 98 |
| 4660 | 98 |
| 4661 | 98 |
| 4662 | 98 |
| 4663 | 100 |
| 4664 | 100 |
| 4665 | 100 |
| 4666 | 100 |
| 4667 | 100 |
| 4668 | 100 |
| 4669 | 100 |
| 4670 | 100 |
| 4671 | 100 |
| 4672 | 100 |
| 4673 | 100 |
| 4674 | 100 |
| 4675 | 100 |
| 4676 | 100 |
| 4677 | 100 |
| 4678 | 90 |
| 4679 | 90 |
| 4680 | 90 |
| 4681 | 90 |
| 4682 | 98 |
| 4683 | 98 |
| 4684 | 98 |
| 4685 | 98 |
| 4686 | 98 |
| 4687 | 100 |
| 4688 | 100 |
| 4689 | 100 |
| 4690 | 100 |
| 4691 | 100 |
| 4692 | 100 |
| 4693 | 100 |
| 4694 | 100 |
| 4695 | 100 |
| 4696 | 100 |
| 4697 | 100 |
| 4698 | 100 |
| 4699 | 100 |
| 4700 | 100 |
| 4701 | 100 |
| 4702 | 90 |
| 4703 | 90 |
| 4704 | 90 |
| 4705 | 90 |
| 4706 | 98 |
| 4707 | 98 |
| 4708 | 98 |
| 4709 | 100 |
| 4710 | 100 |
| 4711 | 100 |
| 4712 | 100 |
| 4713 | 100 |
| 4714 | 100 |
| 4715 | 100 |
| 4716 | 100 |
| 4717 | 100 |
| 4718 | 100 |
| 4719 | 100 |
| 4720 | 100 |
| 4721 | 100 |
| 4722 | 100 |
| 4723 | 100 |
| 4724 | 100 |
| 4725 | 90 |
| 4726 | 90 |
| 4727 | 90 |
| 4728 | 90 |
| 4729 | 90 |
| 4730 | 98 |
| 4731 | 98 |
| 4732 | 98 |
| 4733 | 100 |
| 4734 | 100 |
| 4735 | 100 |
| 4736 | 100 |
| 4737 | 100 |
| 4738 | 100 |
| 4739 | 100 |
| 4740 | 100 |
| 4741 | 100 |
| 4742 | 100 |
| 4743 | 100 |
| 4744 | 100 |
| 4745 | 100 |
| 4746 | 100 |
| 4747 | 100 |
| 4748 | 100 |
| 4749 | 90 |
| 4750 | 90 |
| 4751 | 90 |
| 4752 | 90 |
| 4753 | 90 |
| 4754 | 98 |
| 4755 | 98 |
| 4756 | 98 |
| 4757 | 100 |
| 4758 | 100 |
| 4759 | 100 |
| 4760 | 100 |
| 4761 | 100 |
| 4762 | 100 |
| 4763 | 100 |
| 4764 | 100 |
| 4765 | 100 |
| 4766 | 100 |
| 4767 | 100 |
| 4768 | 100 |
| 4769 | 100 |
| 4770 | 100 |
| 4771 | 100 |
| 4772 | 100 |
| 4773 | 90 |
| 4774 | 90 |
| 4775 | 90 |
| 4776 | 90 |
| 4777 | 90 |
| 4778 | 98 |
| 4779 | 98 |
| 4780 | 98 |
| 4781 | 100 |
| 4782 | 100 |
| 4783 | 100 |
| 4784 | 100 |
| 4785 | 100 |
| 4786 | 100 |
| 4787 | 100 |
| 4788 | 100 |
| 4789 | 100 |
| 4790 | 100 |
| 4791 | 100 |
| 4792 | 100 |
| 4793 | 100 |
| 4794 | 100 |
| 4795 | 100 |
| 4796 | 100 |
| 4797 | 90 |
| 4798 | 90 |
| 4799 | 90 |
| 4800 | 90 |
| 4801 | 90 |
| 4802 | 98 |
| 4803 | 98 |
| 4804 | 98 |
| 4805 | 100 |
| 4806 | 100 |
| 4807 | 100 |
| 4808 | 100 |
| 4809 | 100 |
| 4810 | 100 |
| 4811 | 100 |
| 4812 | 100 |
| 4813 | 100 |
| 4814 | 100 |
| 4815 | 100 |
| 4816 | 100 |
| 4817 | 100 |
| 4818 | 100 |
| 4819 | 100 |
| 4820 | 100 |
| 4821 | 90 |
| 4822 | 90 |
| 4823 | 90 |
| 4824 | 90 |
| 4825 | 90 |
| 4826 | 98 |
| 4827 | 98 |
| 4828 | 98 |
| 4829 | 98 |
| 4830 | 98 |
| 4831 | 100 |
| 4832 | 100 |
| 4833 | 100 |
| 4834 | 100 |
| 4835 | 100 |
| 4836 | 100 |
| 4837 | 100 |
| 4838 | 100 |
| 4839 | 100 |
| 4840 | 100 |
| 4841 | 100 |
| 4842 | 100 |
| 4843 | 100 |
| 4844 | 100 |
| 4845 | 100 |
| 4846 | 90 |
| 4847 | 90 |
| 4848 | 90 |
| 4849 | 90 |
| 4850 | 98 |
| 4851 | 98 |
| 4852 | 98 |
| 4853 | 98 |
| 4854 | 98 |
| 4855 | 100 |
| 4856 | 100 |
| 4857 | 100 |
| 4858 | 100 |
| 4859 | 100 |
| 4860 | 100 |
| 4861 | 100 |
| 4862 | 100 |
| 4863 | 100 |
| 4864 | 100 |
| 4865 | 100 |
| 4866 | 100 |
| 4867 | 100 |
| 4868 | 100 |
| 4869 | 100 |
| 4870 | 90 |
| 4871 | 90 |
| 4872 | 90 |
| 4873 | 90 |
| 4874 | 98 |
| 4875 | 98 |
| 4876 | 98 |
| 4877 | 100 |
| 4878 | 100 |
| 4879 | 100 |
| 4880 | 100 |
| 4881 | 100 |
| 4882 | 100 |
| 4883 | 100 |
| 4884 | 100 |
| 4885 | 100 |
| 4886 | 100 |
| 4887 | 100 |
| 4888 | 100 |
| 4889 | 100 |
| 4890 | 100 |
| 4891 | 100 |
| 4892 | 100 |
| 4893 | 90 |
| 4894 | 90 |
| 4895 | 90 |
| 4896 | 90 |
| 4897 | 90 |
| 4898 | 98 |
| 4899 | 98 |
| 4900 | 98 |
| 4901 | 100 |
| 4902 | 100 |
| 4903 | 100 |
| 4904 | 100 |
| 4905 | 100 |
| 4906 | 100 |
| 4907 | 100 |
| 4908 | 100 |
| 4909 | 100 |
| 4910 | 100 |
| 4911 | 100 |
| 4912 | 100 |
| 4913 | 100 |
| 4914 | 100 |
| 4915 | 100 |
| 4916 | 100 |
| 4917 | 90 |
| 4918 | 90 |
| 4919 | 90 |
| 4920 | 90 |
| 4921 | 90 |
| 4922 | 98 |
| 4923 | 98 |
| 4924 | 98 |
| 4925 | 100 |
| 4926 | 100 |
| 4927 | 100 |
| 4928 | 100 |
| 4929 | 100 |
| 4930 | 100 |
| 4931 | 100 |
| 4932 | 100 |
| 4933 | 100 |
| 4934 | 100 |
| 4935 | 100 |
| 4936 | 100 |
| 4937 | 100 |
| 4938 | 100 |
| 4939 | 100 |
| 4940 | 100 |
| 4941 | 90 |
| 4942 | 90 |
| 4943 | 90 |
| 4944 | 90 |
| 4945 | 90 |
| 4946 | 98 |
| 4947 | 98 |
| 4948 | 98 |
| 4949 | 100 |
| 4950 | 100 |
| 4951 | 100 |
| 4952 | 100 |
| 4953 | 100 |
| 4954 | 100 |
| 4955 | 100 |
| 4956 | 100 |
| 4957 | 100 |
| 4958 | 100 |
| 4959 | 100 |
| 4960 | 100 |
| 4961 | 100 |
| 4962 | 100 |
| 4963 | 100 |
| 4964 | 100 |
| 4965 | 90 |
| 4966 | 90 |
| 4967 | 90 |
| 4968 | 90 |
| 4969 | 90 |
| 4970 | 98 |
| 4971 | 98 |
| 4972 | 98 |
| 4973 | 100 |
| 4974 | 100 |
| 4975 | 100 |
| 4976 | 100 |
| 4977 | 100 |
| 4978 | 100 |
| 4979 | 100 |
| 4980 | 100 |
| 4981 | 100 |
| 4982 | 100 |
| 4983 | 100 |
| 4984 | 100 |
| 4985 | 100 |
| 4986 | 100 |
| 4987 | 100 |
| 4988 | 100 |
| 4989 | 90 |
| 4990 | 90 |
| 4991 | 90 |
| 4992 | 90 |
| 4993 | 90 |
| 4994 | 98 |
| 4995 | 98 |
| 4996 | 98 |
| 4997 | 98 |
| 4998 | 98 |
| 4999 | 100 |
| 5000 | 100 |
| 5001 | 100 |
| 5002 | 100 |
| 5003 | 100 |
| 5004 | 100 |
| 5005 | 100 |
| 5006 | 100 |
| 5007 | 100 |
| 5008 | 100 |
| 5009 | 100 |
| 5010 | 100 |
| 5011 | 100 |
| 5012 | 100 |
| 5013 | 100 |
| 5014 | 90 |
| 5015 | 90 |
| 5016 | 90 |
| 5017 | 90 |
| 5018 | 98 |
| 5019 | 98 |
| 5020 | 98 |
| 5021 | 98 |
| 5022 | 98 |
| 5023 | 100 |
| 5024 | 100 |
| 5025 | 100 |
| 5026 | 100 |
| 5027 | 100 |
| 5028 | 100 |
| 5029 | 100 |
| 5030 | 100 |
| 5031 | 100 |
| 5032 | 100 |
| 5033 | 100 |
| 5034 | 100 |
| 5035 | 100 |
| 5036 | 100 |
| 5037 | 100 |
| 5038 | 90 |
| 5039 | 90 |
| 5040 | 90 |
| 5041 | 90 |
| 5042 | 98 |
| 5043 | 98 |
| 5044 | 98 |
| 5045 | 100 |
| 5046 | 100 |
| 5047 | 100 |
| 5048 | 100 |
| 5049 | 100 |
| 5050 | 100 |
| 5051 | 100 |
| 5052 | 100 |
| 5053 | 100 |
| 5054 | 100 |
| 5055 | 100 |
| 5056 | 100 |
| 5057 | 100 |
| 5058 | 100 |
| 5059 | 100 |
| 5060 | 100 |
| 5061 | 90 |
| 5062 | 90 |
| 5063 | 90 |
| 5064 | 90 |
| 5065 | 90 |
| 5066 | 98 |
| 5067 | 98 |
| 5068 | 98 |
| 5069 | 100 |
| 5070 | 100 |
| 5071 | 100 |
| 5072 | 100 |
| 5073 | 100 |
| 5074 | 100 |
| 5075 | 100 |
| 5076 | 100 |
| 5077 | 100 |
| 5078 | 100 |
| 5079 | 100 |
| 5080 | 100 |
| 5081 | 100 |
| 5082 | 100 |
| 5083 | 100 |
| 5084 | 100 |
| 5085 | 90 |
| 5086 | 90 |
| 5087 | 90 |
| 5088 | 90 |
| 5089 | 90 |
| 5090 | 98 |
| 5091 | 98 |
| 5092 | 98 |
| 5093 | 100 |
| 5094 | 100 |
| 5095 | 100 |
| 5096 | 100 |
| 5097 | 100 |
| 5098 | 100 |
| 5099 | 100 |
| 5100 | 100 |
| 5101 | 100 |
| 5102 | 100 |
| 5103 | 100 |
| 5104 | 100 |
| 5105 | 100 |
| 5106 | 100 |
| 5107 | 100 |
| 5108 | 100 |
| 5109 | 90 |
| 5110 | 90 |
| 5111 | 90 |
| 5112 | 90 |
| 5113 | 90 |
| 5114 | 98 |
| 5115 | 98 |
| 5116 | 98 |
| 5117 | 100 |
| 5118 | 100 |
| 5119 | 100 |
| 5120 | 100 |
| 5121 | 100 |
| 5122 | 100 |
| 5123 | 100 |
| 5124 | 100 |
| 5125 | 100 |
| 5126 | 100 |
| 5127 | 100 |
| 5128 | 100 |
| 5129 | 100 |
| 5130 | 100 |
| 5131 | 100 |
| 5132 | 100 |
| 5133 | 90 |
| 5134 | 90 |
| 5135 | 90 |
| 5136 | 90 |
| 5137 | 90 |
| 5138 | 98 |
| 5139 | 98 |
| 5140 | 98 |
| 5141 | 100 |
| 5142 | 100 |
| 5143 | 100 |
| 5144 | 100 |
| 5145 | 100 |
| 5146 | 100 |
| 5147 | 100 |
| 5148 | 100 |
| 5149 | 100 |
| 5150 | 100 |
| 5151 | 100 |
| 5152 | 100 |
| 5153 | 100 |
| 5154 | 100 |
| 5155 | 100 |
| 5156 | 100 |
| 5157 | 90 |
| 5158 | 90 |
| 5159 | 90 |
| 5160 | 90 |
| 5161 | 90 |
| 5162 | 98 |
| 5163 | 98 |
| 5164 | 98 |
| 5165 | 98 |
| 5166 | 98 |
| 5167 | 100 |
| 5168 | 100 |
| 5169 | 100 |
| 5170 | 100 |
| 5171 | 100 |
| 5172 | 100 |
| 5173 | 100 |
| 5174 | 100 |
| 5175 | 100 |
| 5176 | 100 |
| 5177 | 100 |
| 5178 | 100 |
| 5179 | 100 |
| 5180 | 100 |
| 5181 | 100 |
| 5182 | 90 |
| 5183 | 90 |
| 5184 | 90 |
| 5185 | 90 |
| 5186 | 98 |
| 5187 | 98 |
| 5188 | 98 |
| 5189 | 98 |
| 5190 | 98 |
| 5191 | 100 |
| 5192 | 100 |
| 5193 | 100 |
| 5194 | 100 |
| 5195 | 100 |
| 5196 | 100 |
| 5197 | 100 |
| 5198 | 100 |
| 5199 | 100 |
| 5200 | 100 |
| 5201 | 100 |
| 5202 | 100 |
| 5203 | 100 |
| 5204 | 100 |
| 5205 | 100 |
| 5206 | 90 |
| 5207 | 90 |
| 5208 | 90 |
| 5209 | 90 |
| 5210 | 98 |
| 5211 | 98 |
| 5212 | 98 |
| 5213 | 100 |
| 5214 | 100 |
| 5215 | 100 |
| 5216 | 100 |
| 5217 | 100 |
| 5218 | 100 |
| 5219 | 100 |
| 5220 | 100 |
| 5221 | 100 |
| 5222 | 100 |
| 5223 | 100 |
| 5224 | 100 |
| 5225 | 100 |
| 5226 | 100 |
| 5227 | 100 |
| 5228 | 100 |
| 5229 | 90 |
| 5230 | 90 |
| 5231 | 90 |
| 5232 | 90 |
| 5233 | 90 |
| 5234 | 98 |
| 5235 | 98 |
| 5236 | 98 |
| 5237 | 100 |
| 5238 | 100 |
| 5239 | 100 |
| 5240 | 100 |
| 5241 | 100 |
| 5242 | 100 |
| 5243 | 100 |
| 5244 | 100 |
| 5245 | 100 |
| 5246 | 100 |
| 5247 | 100 |
| 5248 | 100 |
| 5249 | 100 |
| 5250 | 100 |
| 5251 | 100 |
| 5252 | 100 |
| 5253 | 90 |
| 5254 | 90 |
| 5255 | 90 |
| 5256 | 90 |
| 5257 | 90 |
| 5258 | 98 |
| 5259 | 98 |
| 5260 | 98 |
| 5261 | 100 |
| 5262 | 100 |
| 5263 | 100 |
| 5264 | 100 |
| 5265 | 100 |
| 5266 | 100 |
| 5267 | 100 |
| 5268 | 100 |
| 5269 | 100 |
| 5270 | 100 |
| 5271 | 100 |
| 5272 | 100 |
| 5273 | 100 |
| 5274 | 100 |
| 5275 | 100 |
| 5276 | 100 |
| 5277 | 90 |
| 5278 | 90 |
| 5279 | 90 |
| 5280 | 90 |
| 5281 | 90 |
| 5282 | 98 |
| 5283 | 98 |
| 5284 | 98 |
| 5285 | 100 |
| 5286 | 100 |
| 5287 | 100 |
| 5288 | 100 |
| 5289 | 100 |
| 5290 | 100 |
| 5291 | 100 |
| 5292 | 100 |
| 5293 | 100 |
| 5294 | 100 |
| 5295 | 100 |
| 5296 | 100 |
| 5297 | 100 |
| 5298 | 100 |
| 5299 | 100 |
| 5300 | 100 |
| 5301 | 90 |
| 5302 | 90 |
| 5303 | 90 |
| 5304 | 90 |
| 5305 | 90 |
| 5306 | 98 |
| 5307 | 98 |
| 5308 | 98 |
| 5309 | 100 |
| 5310 | 100 |
| 5311 | 100 |
| 5312 | 100 |
| 5313 | 100 |
| 5314 | 100 |
| 5315 | 100 |
| 5316 | 100 |
| 5317 | 100 |
| 5318 | 100 |
| 5319 | 100 |
| 5320 | 100 |
| 5321 | 100 |
| 5322 | 100 |
| 5323 | 100 |
| 5324 | 100 |
| 5325 | 90 |
| 5326 | 90 |
| 5327 | 90 |
| 5328 | 90 |
| 5329 | 90 |
| 5330 | 98 |
| 5331 | 98 |
| 5332 | 98 |
| 5333 | 98 |
| 5334 | 98 |
| 5335 | 100 |
| 5336 | 100 |
| 5337 | 100 |
| 5338 | 100 |
| 5339 | 100 |
| 5340 | 100 |
| 5341 | 100 |
| 5342 | 100 |
| 5343 | 100 |
| 5344 | 100 |
| 5345 | 100 |
| 5346 | 100 |
| 5347 | 100 |
| 5348 | 100 |
| 5349 | 100 |
| 5350 | 90 |
| 5351 | 90 |
| 5352 | 90 |
| 5353 | 90 |
| 5354 | 98 |
| 5355 | 98 |
| 5356 | 98 |
| 5357 | 98 |
| 5358 | 98 |
| 5359 | 100 |
| 5360 | 100 |
| 5361 | 100 |
| 5362 | 100 |
| 5363 | 100 |
| 5364 | 100 |
| 5365 | 100 |
| 5366 | 100 |
| 5367 | 100 |
| 5368 | 100 |
| 5369 | 100 |
| 5370 | 100 |
| 5371 | 100 |
| 5372 | 100 |
| 5373 | 100 |
| 5374 | 90 |
| 5375 | 90 |
| 5376 | 90 |
| 5377 | 90 |
| 5378 | 98 |
| 5379 | 98 |
| 5380 | 98 |
| 5381 | 100 |
| 5382 | 100 |
| 5383 | 100 |
| 5384 | 100 |
| 5385 | 100 |
| 5386 | 100 |
| 5387 | 100 |
| 5388 | 100 |
| 5389 | 100 |
| 5390 | 100 |
| 5391 | 100 |
| 5392 | 100 |
| 5393 | 100 |
| 5394 | 100 |
| 5395 | 100 |
| 5396 | 100 |
| 5397 | 90 |
| 5398 | 90 |
| 5399 | 90 |
| 5400 | 90 |
| 5401 | 90 |
| 5402 | 98 |
| 5403 | 98 |
| 5404 | 98 |
| 5405 | 100 |
| 5406 | 100 |
| 5407 | 100 |
| 5408 | 100 |
| 5409 | 100 |
| 5410 | 100 |
| 5411 | 100 |
| 5412 | 100 |
| 5413 | 100 |
| 5414 | 100 |
| 5415 | 100 |
| 5416 | 100 |
| 5417 | 100 |
| 5418 | 100 |
| 5419 | 100 |
| 5420 | 100 |
| 5421 | 90 |
| 5422 | 90 |
| 5423 | 90 |
| 5424 | 90 |
| 5425 | 90 |
| 5426 | 98 |
| 5427 | 98 |
| 5428 | 98 |
| 5429 | 100 |
| 5430 | 100 |
| 5431 | 100 |
| 5432 | 100 |
| 5433 | 100 |
| 5434 | 100 |
| 5435 | 100 |
| 5436 | 100 |
| 5437 | 100 |
| 5438 | 100 |
| 5439 | 100 |
| 5440 | 100 |
| 5441 | 100 |
| 5442 | 100 |
| 5443 | 100 |
| 5444 | 100 |
| 5445 | 90 |
| 5446 | 90 |
| 5447 | 90 |
| 5448 | 90 |
| 5449 | 90 |
| 5450 | 98 |
| 5451 | 98 |
| 5452 | 98 |
| 5453 | 100 |
| 5454 | 100 |
| 5455 | 100 |
| 5456 | 100 |
| 5457 | 100 |
| 5458 | 100 |
| 5459 | 100 |
| 5460 | 100 |
| 5461 | 100 |
| 5462 | 100 |
| 5463 | 100 |
| 5464 | 100 |
| 5465 | 100 |
| 5466 | 100 |
| 5467 | 100 |
| 5468 | 100 |
| 5469 | 90 |
| 5470 | 90 |
| 5471 | 90 |
| 5472 | 90 |
| 5473 | 90 |
| 5474 | 98 |
| 5475 | 98 |
| 5476 | 98 |
| 5477 | 100 |
| 5478 | 100 |
| 5479 | 100 |
| 5480 | 100 |
| 5481 | 100 |
| 5482 | 100 |
| 5483 | 100 |
| 5484 | 100 |
| 5485 | 100 |
| 5486 | 100 |
| 5487 | 100 |
| 5488 | 100 |
| 5489 | 100 |
| 5490 | 100 |
| 5491 | 100 |
| 5492 | 100 |
| 5493 | 90 |
| 5494 | 90 |
| 5495 | 90 |
| 5496 | 90 |
| 5497 | 90 |
| 5498 | 98 |
| 5499 | 98 |
| 5500 | 98 |
| 5501 | 98 |
| 5502 | 98 |
| 5503 | 100 |
| 5504 | 100 |
| 5505 | 100 |
| 5506 | 100 |
| 5507 | 100 |
| 5508 | 100 |
| 5509 | 100 |
| 5510 | 100 |
| 5511 | 100 |
| 5512 | 100 |
| 5513 | 100 |
| 5514 | 100 |
| 5515 | 100 |
| 5516 | 100 |
| 5517 | 100 |
| 5518 | 90 |
| 5519 | 90 |
| 5520 | 90 |
| 5521 | 90 |
| 5522 | 98 |
| 5523 | 98 |
| 5524 | 98 |
| 5525 | 98 |
| 5526 | 98 |
| 5527 | 100 |
| 5528 | 100 |
| 5529 | 100 |
| 5530 | 100 |
| 5531 | 100 |
| 5532 | 100 |
| 5533 | 100 |
| 5534 | 100 |
| 5535 | 100 |
| 5536 | 100 |
| 5537 | 100 |
| 5538 | 100 |
| 5539 | 100 |
| 5540 | 100 |
| 5541 | 100 |
| 5542 | 90 |
| 5543 | 90 |
| 5544 | 90 |
| 5545 | 90 |
| 5546 | 98 |
| 5547 | 98 |
| 5548 | 98 |
| 5549 | 100 |
| 5550 | 100 |
| 5551 | 100 |
| 5552 | 100 |
| 5553 | 100 |
| 5554 | 100 |
| 5555 | 100 |
| 5556 | 100 |
| 5557 | 100 |
| 5558 | 100 |
| 5559 | 100 |
| 5560 | 100 |
| 5561 | 100 |
| 5562 | 100 |
| 5563 | 100 |
| 5564 | 100 |
| 5565 | 90 |
| 5566 | 90 |
| 5567 | 90 |
| 5568 | 90 |
| 5569 | 90 |
| 5570 | 98 |
| 5571 | 98 |
| 5572 | 98 |
| 5573 | 100 |
| 5574 | 100 |
| 5575 | 100 |
| 5576 | 100 |
| 5577 | 100 |
| 5578 | 100 |
| 5579 | 100 |
| 5580 | 100 |
| 5581 | 100 |
| 5582 | 100 |
| 5583 | 100 |
| 5584 | 100 |
| 5585 | 100 |
| 5586 | 100 |
| 5587 | 100 |
| 5588 | 100 |
| 5589 | 90 |
| 5590 | 90 |
| 5591 | 90 |
| 5592 | 90 |
| 5593 | 90 |
| 5594 | 98 |
| 5595 | 98 |
| 5596 | 98 |
| 5597 | 100 |
| 5598 | 100 |
| 5599 | 100 |
| 5600 | 100 |
| 5601 | 100 |
| 5602 | 100 |
| 5603 | 100 |
| 5604 | 100 |
| 5605 | 100 |
| 5606 | 100 |
| 5607 | 100 |
| 5608 | 100 |
| 5609 | 100 |
| 5610 | 100 |
| 5611 | 100 |
| 5612 | 100 |
| 5613 | 90 |
| 5614 | 90 |
| 5615 | 90 |
| 5616 | 90 |
| 5617 | 90 |
| 5618 | 98 |
| 5619 | 98 |
| 5620 | 98 |
| 5621 | 100 |
| 5622 | 100 |
| 5623 | 100 |
| 5624 | 100 |
| 5625 | 100 |
| 5626 | 100 |
| 5627 | 100 |
| 5628 | 100 |
| 5629 | 100 |
| 5630 | 100 |
| 5631 | 100 |
| 5632 | 100 |
| 5633 | 100 |
| 5634 | 100 |
| 5635 | 100 |
| 5636 | 100 |
| 5637 | 90 |
| 5638 | 90 |
| 5639 | 90 |
| 5640 | 90 |
| 5641 | 90 |
| 5642 | 98 |
| 5643 | 98 |
| 5644 | 98 |
| 5645 | 100 |
| 5646 | 100 |
| 5647 | 100 |
| 5648 | 100 |
| 5649 | 100 |
| 5650 | 100 |
| 5651 | 100 |
| 5652 | 100 |
| 5653 | 100 |
| 5654 | 100 |
| 5655 | 100 |
| 5656 | 100 |
| 5657 | 100 |
| 5658 | 100 |
| 5659 | 100 |
| 5660 | 100 |
| 5661 | 90 |
| 5662 | 90 |
| 5663 | 90 |
| 5664 | 90 |
| 5665 | 90 |
| 5666 | 98 |
| 5667 | 98 |
| 5668 | 98 |
| 5669 | 98 |
| 5670 | 98 |
| 5671 | 100 |
| 5672 | 100 |
| 5673 | 100 |
| 5674 | 100 |
| 5675 | 100 |
| 5676 | 100 |
| 5677 | 100 |
| 5678 | 100 |
| 5679 | 100 |
| 5680 | 100 |
| 5681 | 100 |
| 5682 | 100 |
| 5683 | 100 |
| 5684 | 100 |
| 5685 | 100 |
| 5686 | 90 |
| 5687 | 90 |
| 5688 | 90 |
| 5689 | 90 |
| 5690 | 98 |
| 5691 | 98 |
| 5692 | 98 |
| 5693 | 98 |
| 5694 | 98 |
| 5695 | 100 |
| 5696 | 100 |
| 5697 | 100 |
| 5698 | 100 |
| 5699 | 100 |
| 5700 | 100 |
| 5701 | 100 |
| 5702 | 100 |
| 5703 | 100 |
| 5704 | 100 |
| 5705 | 100 |
| 5706 | 100 |
| 5707 | 100 |
| 5708 | 100 |
| 5709 | 100 |
| 5710 | 90 |
| 5711 | 90 |
| 5712 | 90 |
| 5713 | 90 |
| 5714 | 98 |
| 5715 | 98 |
| 5716 | 98 |
| 5717 | 100 |
| 5718 | 100 |
| 5719 | 100 |
| 5720 | 100 |
| 5721 | 100 |
| 5722 | 100 |
| 5723 | 100 |
| 5724 | 100 |
| 5725 | 100 |
| 5726 | 100 |
| 5727 | 100 |
| 5728 | 100 |
| 5729 | 100 |
| 5730 | 100 |
| 5731 | 100 |
| 5732 | 100 |
| 5733 | 90 |
| 5734 | 90 |
| 5735 | 90 |
| 5736 | 90 |
| 5737 | 90 |
| 5738 | 98 |
| 5739 | 98 |
| 5740 | 98 |
| 5741 | 100 |
| 5742 | 100 |
| 5743 | 100 |
| 5744 | 100 |
| 5745 | 100 |
| 5746 | 100 |
| 5747 | 100 |
| 5748 | 100 |
| 5749 | 100 |
| 5750 | 100 |
| 5751 | 100 |
| 5752 | 100 |
| 5753 | 100 |
| 5754 | 100 |
| 5755 | 100 |
| 5756 | 100 |
| 5757 | 90 |
| 5758 | 90 |
| 5759 | 90 |
| 5760 | 90 |
| 5761 | 90 |
| 5762 | 98 |
| 5763 | 98 |
| 5764 | 98 |
| 5765 | 100 |
| 5766 | 100 |
| 5767 | 100 |
| 5768 | 100 |
| 5769 | 100 |
| 5770 | 100 |
| 5771 | 100 |
| 5772 | 100 |
| 5773 | 100 |
| 5774 | 100 |
| 5775 | 100 |
| 5776 | 100 |
| 5777 | 100 |
| 5778 | 100 |
| 5779 | 100 |
| 5780 | 100 |
| 5781 | 90 |
| 5782 | 90 |
| 5783 | 90 |
| 5784 | 90 |
| 5785 | 90 |
| 5786 | 98 |
| 5787 | 98 |
| 5788 | 98 |
| 5789 | 100 |
| 5790 | 100 |
| 5791 | 100 |
| 5792 | 100 |
| 5793 | 100 |
| 5794 | 100 |
| 5795 | 100 |
| 5796 | 100 |
| 5797 | 100 |
| 5798 | 100 |
| 5799 | 100 |
| 5800 | 100 |
| 5801 | 100 |
| 5802 | 100 |
| 5803 | 100 |
| 5804 | 100 |
| 5805 | 90 |
| 5806 | 90 |
| 5807 | 90 |
| 5808 | 90 |
| 5809 | 90 |
| 5810 | 98 |
| 5811 | 98 |
| 5812 | 98 |
| 5813 | 100 |
| 5814 | 100 |
| 5815 | 100 |
| 5816 | 100 |
| 5817 | 100 |
| 5818 | 100 |
| 5819 | 100 |
| 5820 | 100 |
| 5821 | 100 |
| 5822 | 100 |
| 5823 | 100 |
| 5824 | 100 |
| 5825 | 100 |
| 5826 | 100 |
| 5827 | 100 |
| 5828 | 100 |
| 5829 | 90 |
| 5830 | 90 |
| 5831 | 90 |
| 5832 | 90 |
| 5833 | 90 |
| 5834 | 98 |
| 5835 | 98 |
| 5836 | 98 |
| 5837 | 98 |
| 5838 | 98 |
| 5839 | 100 |
| 5840 | 100 |
| 5841 | 100 |
| 5842 | 100 |
| 5843 | 100 |
| 5844 | 100 |
| 5845 | 100 |
| 5846 | 100 |
| 5847 | 100 |
| 5848 | 100 |
| 5849 | 100 |
| 5850 | 100 |
| 5851 | 100 |
| 5852 | 100 |
| 5853 | 100 |
| 5854 | 90 |
| 5855 | 90 |